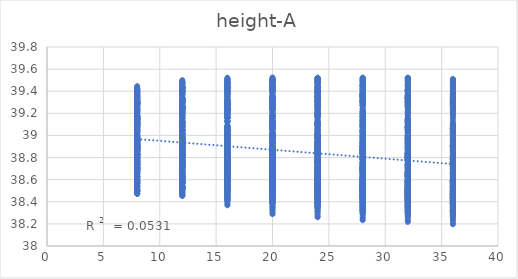
| Category | out:UTCI |
|---|---|
| 8.0 | 38.668 |
| 8.0 | 38.741 |
| 8.0 | 38.758 |
| 8.0 | 38.744 |
| 8.0 | 38.714 |
| 12.0 | 38.517 |
| 12.0 | 38.595 |
| 12.0 | 38.642 |
| 12.0 | 38.679 |
| 12.0 | 38.672 |
| 16.0 | 38.457 |
| 16.0 | 38.521 |
| 16.0 | 38.559 |
| 16.0 | 38.588 |
| 16.0 | 38.606 |
| 20.0 | 38.426 |
| 20.0 | 38.489 |
| 20.0 | 38.495 |
| 20.0 | 38.526 |
| 20.0 | 38.543 |
| 24.0 | 38.423 |
| 24.0 | 38.454 |
| 24.0 | 38.47 |
| 24.0 | 38.474 |
| 24.0 | 38.492 |
| 28.0 | 38.417 |
| 28.0 | 38.42 |
| 28.0 | 38.46 |
| 28.0 | 38.458 |
| 28.0 | 38.452 |
| 32.0 | 38.414 |
| 32.0 | 38.429 |
| 32.0 | 38.432 |
| 32.0 | 38.448 |
| 32.0 | 38.426 |
| 36.0 | 38.403 |
| 36.0 | 38.423 |
| 36.0 | 38.41 |
| 36.0 | 38.426 |
| 36.0 | 38.414 |
| 8.0 | 38.693 |
| 8.0 | 38.779 |
| 8.0 | 38.826 |
| 8.0 | 38.826 |
| 8.0 | 38.8 |
| 12.0 | 38.522 |
| 12.0 | 38.629 |
| 12.0 | 38.708 |
| 12.0 | 38.76 |
| 12.0 | 38.75 |
| 16.0 | 38.432 |
| 16.0 | 38.535 |
| 16.0 | 38.614 |
| 16.0 | 38.657 |
| 16.0 | 38.685 |
| 20.0 | 38.386 |
| 20.0 | 38.482 |
| 20.0 | 38.531 |
| 20.0 | 38.588 |
| 20.0 | 38.615 |
| 24.0 | 38.378 |
| 24.0 | 38.439 |
| 24.0 | 38.492 |
| 24.0 | 38.522 |
| 24.0 | 38.553 |
| 28.0 | 38.37 |
| 28.0 | 38.397 |
| 28.0 | 38.476 |
| 28.0 | 38.494 |
| 28.0 | 38.504 |
| 32.0 | 38.364 |
| 32.0 | 38.402 |
| 32.0 | 38.442 |
| 32.0 | 38.48 |
| 32.0 | 38.47 |
| 36.0 | 38.352 |
| 36.0 | 38.397 |
| 36.0 | 38.416 |
| 36.0 | 38.455 |
| 36.0 | 38.456 |
| 8.0 | 38.703 |
| 8.0 | 38.82 |
| 8.0 | 38.854 |
| 8.0 | 38.875 |
| 8.0 | 38.856 |
| 12.0 | 38.522 |
| 12.0 | 38.662 |
| 12.0 | 38.729 |
| 12.0 | 38.799 |
| 12.0 | 38.802 |
| 16.0 | 38.418 |
| 16.0 | 38.557 |
| 16.0 | 38.63 |
| 16.0 | 38.697 |
| 16.0 | 38.734 |
| 20.0 | 38.355 |
| 20.0 | 38.493 |
| 20.0 | 38.54 |
| 20.0 | 38.623 |
| 20.0 | 38.661 |
| 24.0 | 38.34 |
| 24.0 | 38.436 |
| 24.0 | 38.489 |
| 24.0 | 38.549 |
| 24.0 | 38.593 |
| 28.0 | 38.33 |
| 28.0 | 38.388 |
| 28.0 | 38.463 |
| 28.0 | 38.512 |
| 28.0 | 38.534 |
| 32.0 | 38.324 |
| 32.0 | 38.389 |
| 32.0 | 38.424 |
| 32.0 | 38.49 |
| 32.0 | 38.494 |
| 36.0 | 38.31 |
| 36.0 | 38.383 |
| 36.0 | 38.394 |
| 36.0 | 38.462 |
| 36.0 | 38.472 |
| 8.0 | 38.712 |
| 8.0 | 38.824 |
| 8.0 | 38.878 |
| 8.0 | 38.886 |
| 8.0 | 38.88 |
| 12.0 | 38.524 |
| 12.0 | 38.658 |
| 12.0 | 38.749 |
| 12.0 | 38.808 |
| 12.0 | 38.826 |
| 16.0 | 38.414 |
| 16.0 | 38.547 |
| 16.0 | 38.644 |
| 16.0 | 38.704 |
| 16.0 | 38.756 |
| 20.0 | 38.343 |
| 20.0 | 38.474 |
| 20.0 | 38.547 |
| 20.0 | 38.622 |
| 20.0 | 38.68 |
| 24.0 | 38.319 |
| 24.0 | 38.407 |
| 24.0 | 38.491 |
| 24.0 | 38.544 |
| 24.0 | 38.609 |
| 28.0 | 38.305 |
| 28.0 | 38.348 |
| 28.0 | 38.458 |
| 28.0 | 38.501 |
| 28.0 | 38.547 |
| 32.0 | 38.297 |
| 32.0 | 38.344 |
| 32.0 | 38.413 |
| 32.0 | 38.473 |
| 32.0 | 38.499 |
| 36.0 | 38.282 |
| 36.0 | 38.334 |
| 36.0 | 38.38 |
| 36.0 | 38.439 |
| 36.0 | 38.473 |
| 8.0 | 38.71 |
| 8.0 | 38.832 |
| 8.0 | 38.879 |
| 8.0 | 38.908 |
| 8.0 | 38.891 |
| 12.0 | 38.52 |
| 12.0 | 38.661 |
| 12.0 | 38.745 |
| 12.0 | 38.826 |
| 12.0 | 38.833 |
| 16.0 | 38.406 |
| 16.0 | 38.545 |
| 16.0 | 38.636 |
| 16.0 | 38.719 |
| 16.0 | 38.76 |
| 20.0 | 38.332 |
| 20.0 | 38.468 |
| 20.0 | 38.534 |
| 20.0 | 38.634 |
| 20.0 | 38.681 |
| 24.0 | 38.305 |
| 24.0 | 38.398 |
| 24.0 | 38.477 |
| 24.0 | 38.554 |
| 24.0 | 38.609 |
| 28.0 | 38.285 |
| 28.0 | 38.335 |
| 28.0 | 38.439 |
| 28.0 | 38.509 |
| 28.0 | 38.543 |
| 32.0 | 38.275 |
| 32.0 | 38.327 |
| 32.0 | 38.388 |
| 32.0 | 38.475 |
| 32.0 | 38.493 |
| 36.0 | 38.26 |
| 36.0 | 38.313 |
| 36.0 | 38.346 |
| 36.0 | 38.434 |
| 36.0 | 38.462 |
| 8.0 | 38.703 |
| 8.0 | 38.833 |
| 8.0 | 38.884 |
| 8.0 | 38.91 |
| 8.0 | 38.909 |
| 12.0 | 38.51 |
| 12.0 | 38.661 |
| 12.0 | 38.746 |
| 12.0 | 38.824 |
| 12.0 | 38.847 |
| 16.0 | 38.396 |
| 16.0 | 38.542 |
| 16.0 | 38.633 |
| 16.0 | 38.716 |
| 16.0 | 38.771 |
| 20.0 | 38.319 |
| 20.0 | 38.461 |
| 20.0 | 38.527 |
| 20.0 | 38.627 |
| 20.0 | 38.69 |
| 24.0 | 38.291 |
| 24.0 | 38.389 |
| 24.0 | 38.467 |
| 24.0 | 38.544 |
| 24.0 | 38.616 |
| 28.0 | 38.265 |
| 28.0 | 38.321 |
| 28.0 | 38.423 |
| 28.0 | 38.494 |
| 28.0 | 38.545 |
| 32.0 | 38.252 |
| 32.0 | 38.309 |
| 32.0 | 38.368 |
| 32.0 | 38.459 |
| 32.0 | 38.493 |
| 36.0 | 38.235 |
| 36.0 | 38.291 |
| 36.0 | 38.321 |
| 36.0 | 38.415 |
| 36.0 | 38.457 |
| 8.0 | 38.688 |
| 8.0 | 38.836 |
| 8.0 | 38.885 |
| 8.0 | 38.915 |
| 8.0 | 38.902 |
| 12.0 | 38.494 |
| 12.0 | 38.663 |
| 12.0 | 38.747 |
| 12.0 | 38.825 |
| 12.0 | 38.839 |
| 16.0 | 38.379 |
| 16.0 | 38.543 |
| 16.0 | 38.631 |
| 16.0 | 38.714 |
| 16.0 | 38.76 |
| 20.0 | 38.301 |
| 20.0 | 38.46 |
| 20.0 | 38.522 |
| 20.0 | 38.623 |
| 20.0 | 38.676 |
| 24.0 | 38.273 |
| 24.0 | 38.386 |
| 24.0 | 38.461 |
| 24.0 | 38.537 |
| 24.0 | 38.601 |
| 28.0 | 38.247 |
| 28.0 | 38.316 |
| 28.0 | 38.415 |
| 28.0 | 38.485 |
| 28.0 | 38.528 |
| 32.0 | 38.232 |
| 32.0 | 38.303 |
| 32.0 | 38.358 |
| 32.0 | 38.448 |
| 32.0 | 38.475 |
| 36.0 | 38.212 |
| 36.0 | 38.282 |
| 36.0 | 38.309 |
| 36.0 | 38.402 |
| 36.0 | 38.438 |
| 8.0 | 38.678 |
| 8.0 | 38.832 |
| 8.0 | 38.888 |
| 8.0 | 38.904 |
| 8.0 | 38.906 |
| 12.0 | 38.483 |
| 12.0 | 38.657 |
| 12.0 | 38.748 |
| 12.0 | 38.812 |
| 12.0 | 38.839 |
| 16.0 | 38.368 |
| 16.0 | 38.535 |
| 16.0 | 38.632 |
| 16.0 | 38.699 |
| 16.0 | 38.759 |
| 20.0 | 38.288 |
| 20.0 | 38.452 |
| 20.0 | 38.521 |
| 20.0 | 38.606 |
| 20.0 | 38.672 |
| 24.0 | 38.26 |
| 24.0 | 38.375 |
| 24.0 | 38.456 |
| 24.0 | 38.518 |
| 24.0 | 38.596 |
| 28.0 | 38.234 |
| 28.0 | 38.302 |
| 28.0 | 38.407 |
| 28.0 | 38.46 |
| 28.0 | 38.518 |
| 32.0 | 38.218 |
| 32.0 | 38.288 |
| 32.0 | 38.349 |
| 32.0 | 38.422 |
| 32.0 | 38.464 |
| 36.0 | 38.197 |
| 36.0 | 38.267 |
| 36.0 | 38.3 |
| 36.0 | 38.375 |
| 36.0 | 38.426 |
| 8.0 | 38.717 |
| 8.0 | 38.761 |
| 8.0 | 38.802 |
| 8.0 | 38.76 |
| 8.0 | 38.723 |
| 12.0 | 38.567 |
| 12.0 | 38.643 |
| 12.0 | 38.711 |
| 12.0 | 38.699 |
| 12.0 | 38.701 |
| 16.0 | 38.508 |
| 16.0 | 38.539 |
| 16.0 | 38.602 |
| 16.0 | 38.629 |
| 16.0 | 38.636 |
| 20.0 | 38.472 |
| 20.0 | 38.507 |
| 20.0 | 38.535 |
| 20.0 | 38.542 |
| 20.0 | 38.569 |
| 24.0 | 38.459 |
| 24.0 | 38.454 |
| 24.0 | 38.507 |
| 24.0 | 38.491 |
| 24.0 | 38.509 |
| 28.0 | 38.466 |
| 28.0 | 38.451 |
| 28.0 | 38.5 |
| 28.0 | 38.473 |
| 28.0 | 38.465 |
| 32.0 | 38.441 |
| 32.0 | 38.454 |
| 32.0 | 38.455 |
| 32.0 | 38.449 |
| 32.0 | 38.442 |
| 36.0 | 38.436 |
| 36.0 | 38.425 |
| 36.0 | 38.438 |
| 36.0 | 38.433 |
| 36.0 | 38.428 |
| 8.0 | 38.762 |
| 8.0 | 38.84 |
| 8.0 | 38.893 |
| 8.0 | 38.85 |
| 8.0 | 38.832 |
| 12.0 | 38.593 |
| 12.0 | 38.72 |
| 12.0 | 38.795 |
| 12.0 | 38.794 |
| 12.0 | 38.81 |
| 16.0 | 38.508 |
| 16.0 | 38.601 |
| 16.0 | 38.677 |
| 16.0 | 38.714 |
| 16.0 | 38.737 |
| 20.0 | 38.453 |
| 20.0 | 38.546 |
| 20.0 | 38.594 |
| 20.0 | 38.622 |
| 20.0 | 38.669 |
| 24.0 | 38.435 |
| 24.0 | 38.482 |
| 24.0 | 38.551 |
| 24.0 | 38.557 |
| 24.0 | 38.6 |
| 28.0 | 38.441 |
| 28.0 | 38.47 |
| 28.0 | 38.537 |
| 28.0 | 38.527 |
| 28.0 | 38.546 |
| 32.0 | 38.41 |
| 32.0 | 38.471 |
| 32.0 | 38.486 |
| 32.0 | 38.498 |
| 32.0 | 38.513 |
| 36.0 | 38.402 |
| 36.0 | 38.442 |
| 36.0 | 38.466 |
| 36.0 | 38.478 |
| 36.0 | 38.496 |
| 8.0 | 38.778 |
| 8.0 | 38.869 |
| 8.0 | 38.908 |
| 8.0 | 38.92 |
| 8.0 | 38.88 |
| 12.0 | 38.597 |
| 12.0 | 38.741 |
| 12.0 | 38.808 |
| 12.0 | 38.862 |
| 12.0 | 38.849 |
| 16.0 | 38.496 |
| 16.0 | 38.61 |
| 16.0 | 38.69 |
| 16.0 | 38.768 |
| 16.0 | 38.776 |
| 20.0 | 38.426 |
| 20.0 | 38.546 |
| 20.0 | 38.6 |
| 20.0 | 38.673 |
| 20.0 | 38.704 |
| 24.0 | 38.398 |
| 24.0 | 38.47 |
| 24.0 | 38.546 |
| 24.0 | 38.602 |
| 24.0 | 38.631 |
| 28.0 | 38.4 |
| 28.0 | 38.452 |
| 28.0 | 38.522 |
| 28.0 | 38.562 |
| 28.0 | 38.57 |
| 32.0 | 38.372 |
| 32.0 | 38.448 |
| 32.0 | 38.465 |
| 32.0 | 38.525 |
| 32.0 | 38.531 |
| 36.0 | 38.362 |
| 36.0 | 38.418 |
| 36.0 | 38.441 |
| 36.0 | 38.503 |
| 36.0 | 38.508 |
| 8.0 | 38.774 |
| 8.0 | 38.881 |
| 8.0 | 38.947 |
| 8.0 | 38.917 |
| 8.0 | 38.921 |
| 12.0 | 38.585 |
| 12.0 | 38.745 |
| 12.0 | 38.841 |
| 12.0 | 38.854 |
| 12.0 | 38.891 |
| 16.0 | 38.477 |
| 16.0 | 38.608 |
| 16.0 | 38.717 |
| 16.0 | 38.763 |
| 16.0 | 38.815 |
| 20.0 | 38.412 |
| 20.0 | 38.543 |
| 20.0 | 38.62 |
| 20.0 | 38.667 |
| 20.0 | 38.741 |
| 24.0 | 38.375 |
| 24.0 | 38.46 |
| 24.0 | 38.563 |
| 24.0 | 38.592 |
| 24.0 | 38.666 |
| 28.0 | 38.373 |
| 28.0 | 38.433 |
| 28.0 | 38.532 |
| 28.0 | 38.548 |
| 28.0 | 38.602 |
| 32.0 | 38.348 |
| 32.0 | 38.425 |
| 32.0 | 38.469 |
| 32.0 | 38.504 |
| 32.0 | 38.556 |
| 36.0 | 38.335 |
| 36.0 | 38.391 |
| 36.0 | 38.44 |
| 36.0 | 38.478 |
| 36.0 | 38.529 |
| 8.0 | 38.764 |
| 8.0 | 38.86 |
| 8.0 | 38.954 |
| 8.0 | 38.945 |
| 8.0 | 38.925 |
| 12.0 | 38.572 |
| 12.0 | 38.722 |
| 12.0 | 38.844 |
| 12.0 | 38.878 |
| 12.0 | 38.892 |
| 16.0 | 38.461 |
| 16.0 | 38.579 |
| 16.0 | 38.716 |
| 16.0 | 38.783 |
| 16.0 | 38.812 |
| 20.0 | 38.393 |
| 20.0 | 38.509 |
| 20.0 | 38.615 |
| 20.0 | 38.684 |
| 20.0 | 38.737 |
| 24.0 | 38.358 |
| 24.0 | 38.433 |
| 24.0 | 38.555 |
| 24.0 | 38.607 |
| 24.0 | 38.661 |
| 28.0 | 38.349 |
| 28.0 | 38.4 |
| 28.0 | 38.519 |
| 28.0 | 38.561 |
| 28.0 | 38.595 |
| 32.0 | 38.324 |
| 32.0 | 38.389 |
| 32.0 | 38.453 |
| 32.0 | 38.514 |
| 32.0 | 38.546 |
| 36.0 | 38.31 |
| 36.0 | 38.352 |
| 36.0 | 38.416 |
| 36.0 | 38.48 |
| 36.0 | 38.515 |
| 8.0 | 38.776 |
| 8.0 | 38.889 |
| 8.0 | 38.964 |
| 8.0 | 38.959 |
| 8.0 | 38.943 |
| 12.0 | 38.584 |
| 12.0 | 38.746 |
| 12.0 | 38.852 |
| 12.0 | 38.889 |
| 12.0 | 38.906 |
| 16.0 | 38.47 |
| 16.0 | 38.601 |
| 16.0 | 38.719 |
| 16.0 | 38.792 |
| 16.0 | 38.823 |
| 20.0 | 38.4 |
| 20.0 | 38.526 |
| 20.0 | 38.614 |
| 20.0 | 38.69 |
| 20.0 | 38.746 |
| 24.0 | 38.362 |
| 24.0 | 38.445 |
| 24.0 | 38.552 |
| 24.0 | 38.61 |
| 24.0 | 38.668 |
| 28.0 | 38.339 |
| 28.0 | 38.392 |
| 28.0 | 38.506 |
| 28.0 | 38.559 |
| 28.0 | 38.593 |
| 32.0 | 38.31 |
| 32.0 | 38.378 |
| 32.0 | 38.435 |
| 32.0 | 38.51 |
| 32.0 | 38.543 |
| 36.0 | 38.294 |
| 36.0 | 38.339 |
| 36.0 | 38.394 |
| 36.0 | 38.473 |
| 36.0 | 38.507 |
| 8.0 | 38.763 |
| 8.0 | 38.894 |
| 8.0 | 38.944 |
| 8.0 | 38.952 |
| 8.0 | 38.955 |
| 12.0 | 38.566 |
| 12.0 | 38.75 |
| 12.0 | 38.829 |
| 12.0 | 38.879 |
| 12.0 | 38.918 |
| 16.0 | 38.451 |
| 16.0 | 38.603 |
| 16.0 | 38.695 |
| 16.0 | 38.778 |
| 16.0 | 38.832 |
| 20.0 | 38.379 |
| 20.0 | 38.526 |
| 20.0 | 38.588 |
| 20.0 | 38.674 |
| 20.0 | 38.752 |
| 24.0 | 38.339 |
| 24.0 | 38.442 |
| 24.0 | 38.525 |
| 24.0 | 38.591 |
| 24.0 | 38.672 |
| 28.0 | 38.314 |
| 28.0 | 38.388 |
| 28.0 | 38.476 |
| 28.0 | 38.538 |
| 28.0 | 38.596 |
| 32.0 | 38.292 |
| 32.0 | 38.373 |
| 32.0 | 38.415 |
| 32.0 | 38.491 |
| 32.0 | 38.548 |
| 36.0 | 38.274 |
| 36.0 | 38.334 |
| 36.0 | 38.371 |
| 36.0 | 38.454 |
| 36.0 | 38.51 |
| 8.0 | 38.741 |
| 8.0 | 38.87 |
| 8.0 | 38.954 |
| 8.0 | 38.95 |
| 8.0 | 38.959 |
| 12.0 | 38.541 |
| 12.0 | 38.726 |
| 12.0 | 38.839 |
| 12.0 | 38.874 |
| 12.0 | 38.92 |
| 16.0 | 38.429 |
| 16.0 | 38.579 |
| 16.0 | 38.703 |
| 16.0 | 38.773 |
| 16.0 | 38.834 |
| 20.0 | 38.358 |
| 20.0 | 38.501 |
| 20.0 | 38.595 |
| 20.0 | 38.667 |
| 20.0 | 38.751 |
| 24.0 | 38.318 |
| 24.0 | 38.415 |
| 24.0 | 38.528 |
| 24.0 | 38.583 |
| 24.0 | 38.669 |
| 28.0 | 38.293 |
| 28.0 | 38.359 |
| 28.0 | 38.477 |
| 28.0 | 38.525 |
| 28.0 | 38.588 |
| 32.0 | 38.269 |
| 32.0 | 38.344 |
| 32.0 | 38.413 |
| 32.0 | 38.476 |
| 32.0 | 38.539 |
| 36.0 | 38.259 |
| 36.0 | 38.316 |
| 36.0 | 38.368 |
| 36.0 | 38.435 |
| 36.0 | 38.496 |
| 8.0 | 38.79 |
| 8.0 | 38.817 |
| 8.0 | 38.802 |
| 8.0 | 38.809 |
| 8.0 | 38.819 |
| 12.0 | 38.619 |
| 12.0 | 38.723 |
| 12.0 | 38.74 |
| 12.0 | 38.769 |
| 12.0 | 38.764 |
| 16.0 | 38.538 |
| 16.0 | 38.586 |
| 16.0 | 38.651 |
| 16.0 | 38.706 |
| 16.0 | 38.716 |
| 20.0 | 38.503 |
| 20.0 | 38.541 |
| 20.0 | 38.563 |
| 20.0 | 38.624 |
| 20.0 | 38.652 |
| 24.0 | 38.477 |
| 24.0 | 38.501 |
| 24.0 | 38.516 |
| 24.0 | 38.562 |
| 24.0 | 38.586 |
| 28.0 | 38.472 |
| 28.0 | 38.47 |
| 28.0 | 38.49 |
| 28.0 | 38.512 |
| 28.0 | 38.535 |
| 32.0 | 38.455 |
| 32.0 | 38.465 |
| 32.0 | 38.457 |
| 32.0 | 38.503 |
| 32.0 | 38.493 |
| 36.0 | 38.445 |
| 36.0 | 38.453 |
| 36.0 | 38.441 |
| 36.0 | 38.476 |
| 36.0 | 38.472 |
| 8.0 | 38.822 |
| 8.0 | 38.918 |
| 8.0 | 38.896 |
| 8.0 | 38.908 |
| 8.0 | 38.923 |
| 12.0 | 38.633 |
| 12.0 | 38.801 |
| 12.0 | 38.832 |
| 12.0 | 38.855 |
| 12.0 | 38.874 |
| 16.0 | 38.533 |
| 16.0 | 38.666 |
| 16.0 | 38.731 |
| 16.0 | 38.786 |
| 16.0 | 38.823 |
| 20.0 | 38.48 |
| 20.0 | 38.605 |
| 20.0 | 38.638 |
| 20.0 | 38.704 |
| 20.0 | 38.756 |
| 24.0 | 38.446 |
| 24.0 | 38.551 |
| 24.0 | 38.578 |
| 24.0 | 38.632 |
| 24.0 | 38.681 |
| 28.0 | 38.44 |
| 28.0 | 38.514 |
| 28.0 | 38.543 |
| 28.0 | 38.574 |
| 28.0 | 38.625 |
| 32.0 | 38.42 |
| 32.0 | 38.507 |
| 32.0 | 38.507 |
| 32.0 | 38.557 |
| 32.0 | 38.577 |
| 36.0 | 38.411 |
| 36.0 | 38.493 |
| 36.0 | 38.486 |
| 36.0 | 38.527 |
| 36.0 | 38.549 |
| 8.0 | 38.832 |
| 8.0 | 38.925 |
| 8.0 | 38.944 |
| 8.0 | 38.969 |
| 8.0 | 38.98 |
| 12.0 | 38.632 |
| 12.0 | 38.813 |
| 12.0 | 38.868 |
| 12.0 | 38.91 |
| 12.0 | 38.928 |
| 16.0 | 38.52 |
| 16.0 | 38.667 |
| 16.0 | 38.765 |
| 16.0 | 38.841 |
| 16.0 | 38.865 |
| 20.0 | 38.457 |
| 20.0 | 38.599 |
| 20.0 | 38.667 |
| 20.0 | 38.756 |
| 20.0 | 38.796 |
| 24.0 | 38.418 |
| 24.0 | 38.535 |
| 24.0 | 38.6 |
| 24.0 | 38.68 |
| 24.0 | 38.722 |
| 28.0 | 38.405 |
| 28.0 | 38.488 |
| 28.0 | 38.555 |
| 28.0 | 38.614 |
| 28.0 | 38.662 |
| 32.0 | 38.384 |
| 32.0 | 38.477 |
| 32.0 | 38.514 |
| 32.0 | 38.591 |
| 32.0 | 38.607 |
| 36.0 | 38.374 |
| 36.0 | 38.461 |
| 36.0 | 38.489 |
| 36.0 | 38.555 |
| 36.0 | 38.574 |
| 8.0 | 38.833 |
| 8.0 | 38.943 |
| 8.0 | 38.957 |
| 8.0 | 38.99 |
| 8.0 | 39.021 |
| 12.0 | 38.626 |
| 12.0 | 38.826 |
| 12.0 | 38.88 |
| 12.0 | 38.932 |
| 12.0 | 38.966 |
| 16.0 | 38.509 |
| 16.0 | 38.674 |
| 16.0 | 38.772 |
| 16.0 | 38.86 |
| 16.0 | 38.9 |
| 20.0 | 38.443 |
| 20.0 | 38.593 |
| 20.0 | 38.666 |
| 20.0 | 38.77 |
| 20.0 | 38.829 |
| 24.0 | 38.399 |
| 24.0 | 38.525 |
| 24.0 | 38.596 |
| 24.0 | 38.692 |
| 24.0 | 38.753 |
| 28.0 | 38.381 |
| 28.0 | 38.471 |
| 28.0 | 38.546 |
| 28.0 | 38.623 |
| 28.0 | 38.691 |
| 32.0 | 38.359 |
| 32.0 | 38.455 |
| 32.0 | 38.5 |
| 32.0 | 38.595 |
| 32.0 | 38.634 |
| 36.0 | 38.347 |
| 36.0 | 38.435 |
| 36.0 | 38.466 |
| 36.0 | 38.552 |
| 36.0 | 38.596 |
| 8.0 | 38.83 |
| 8.0 | 38.943 |
| 8.0 | 38.97 |
| 8.0 | 39 |
| 8.0 | 39.032 |
| 12.0 | 38.622 |
| 12.0 | 38.822 |
| 12.0 | 38.889 |
| 12.0 | 38.938 |
| 12.0 | 38.971 |
| 16.0 | 38.5 |
| 16.0 | 38.666 |
| 16.0 | 38.777 |
| 16.0 | 38.864 |
| 16.0 | 38.907 |
| 20.0 | 38.43 |
| 20.0 | 38.581 |
| 20.0 | 38.668 |
| 20.0 | 38.771 |
| 20.0 | 38.834 |
| 24.0 | 38.386 |
| 24.0 | 38.507 |
| 24.0 | 38.596 |
| 24.0 | 38.69 |
| 24.0 | 38.761 |
| 28.0 | 38.364 |
| 28.0 | 38.45 |
| 28.0 | 38.544 |
| 28.0 | 38.619 |
| 28.0 | 38.696 |
| 32.0 | 38.343 |
| 32.0 | 38.43 |
| 32.0 | 38.496 |
| 32.0 | 38.588 |
| 32.0 | 38.637 |
| 36.0 | 38.329 |
| 36.0 | 38.406 |
| 36.0 | 38.457 |
| 36.0 | 38.541 |
| 36.0 | 38.595 |
| 8.0 | 38.839 |
| 8.0 | 38.94 |
| 8.0 | 38.98 |
| 8.0 | 39.012 |
| 8.0 | 39.033 |
| 12.0 | 38.628 |
| 12.0 | 38.815 |
| 12.0 | 38.899 |
| 12.0 | 38.947 |
| 12.0 | 38.974 |
| 16.0 | 38.505 |
| 16.0 | 38.654 |
| 16.0 | 38.782 |
| 16.0 | 38.869 |
| 16.0 | 38.907 |
| 20.0 | 38.435 |
| 20.0 | 38.566 |
| 20.0 | 38.668 |
| 20.0 | 38.774 |
| 20.0 | 38.832 |
| 24.0 | 38.389 |
| 24.0 | 38.49 |
| 24.0 | 38.594 |
| 24.0 | 38.691 |
| 24.0 | 38.757 |
| 28.0 | 38.361 |
| 28.0 | 38.434 |
| 28.0 | 38.543 |
| 28.0 | 38.615 |
| 28.0 | 38.687 |
| 32.0 | 38.336 |
| 32.0 | 38.413 |
| 32.0 | 38.494 |
| 32.0 | 38.582 |
| 32.0 | 38.626 |
| 36.0 | 38.322 |
| 36.0 | 38.386 |
| 36.0 | 38.452 |
| 36.0 | 38.533 |
| 36.0 | 38.583 |
| 8.0 | 38.833 |
| 8.0 | 38.948 |
| 8.0 | 38.979 |
| 8.0 | 39.032 |
| 8.0 | 39.057 |
| 12.0 | 38.621 |
| 12.0 | 38.822 |
| 12.0 | 38.895 |
| 12.0 | 38.966 |
| 12.0 | 38.994 |
| 16.0 | 38.496 |
| 16.0 | 38.66 |
| 16.0 | 38.777 |
| 16.0 | 38.884 |
| 16.0 | 38.926 |
| 20.0 | 38.425 |
| 20.0 | 38.57 |
| 20.0 | 38.662 |
| 20.0 | 38.787 |
| 20.0 | 38.849 |
| 24.0 | 38.379 |
| 24.0 | 38.492 |
| 24.0 | 38.586 |
| 24.0 | 38.701 |
| 24.0 | 38.771 |
| 28.0 | 38.351 |
| 28.0 | 38.434 |
| 28.0 | 38.532 |
| 28.0 | 38.623 |
| 28.0 | 38.7 |
| 32.0 | 38.326 |
| 32.0 | 38.412 |
| 32.0 | 38.482 |
| 32.0 | 38.589 |
| 32.0 | 38.635 |
| 36.0 | 38.311 |
| 36.0 | 38.384 |
| 36.0 | 38.439 |
| 36.0 | 38.54 |
| 36.0 | 38.59 |
| 8.0 | 38.837 |
| 8.0 | 38.948 |
| 8.0 | 38.981 |
| 8.0 | 39.031 |
| 8.0 | 39.053 |
| 12.0 | 38.628 |
| 12.0 | 38.822 |
| 12.0 | 38.897 |
| 12.0 | 38.963 |
| 12.0 | 38.99 |
| 16.0 | 38.499 |
| 16.0 | 38.659 |
| 16.0 | 38.776 |
| 16.0 | 38.88 |
| 16.0 | 38.92 |
| 20.0 | 38.426 |
| 20.0 | 38.566 |
| 20.0 | 38.658 |
| 20.0 | 38.781 |
| 20.0 | 38.843 |
| 24.0 | 38.38 |
| 24.0 | 38.486 |
| 24.0 | 38.578 |
| 24.0 | 38.69 |
| 24.0 | 38.76 |
| 28.0 | 38.351 |
| 28.0 | 38.427 |
| 28.0 | 38.523 |
| 28.0 | 38.61 |
| 28.0 | 38.688 |
| 32.0 | 38.325 |
| 32.0 | 38.404 |
| 32.0 | 38.471 |
| 32.0 | 38.576 |
| 32.0 | 38.622 |
| 36.0 | 38.305 |
| 36.0 | 38.369 |
| 36.0 | 38.417 |
| 36.0 | 38.526 |
| 36.0 | 38.58 |
| 8.0 | 38.891 |
| 8.0 | 38.894 |
| 8.0 | 38.962 |
| 8.0 | 38.928 |
| 8.0 | 38.893 |
| 12.0 | 38.713 |
| 12.0 | 38.833 |
| 12.0 | 38.901 |
| 12.0 | 38.871 |
| 12.0 | 38.873 |
| 16.0 | 38.625 |
| 16.0 | 38.708 |
| 16.0 | 38.813 |
| 16.0 | 38.824 |
| 16.0 | 38.81 |
| 20.0 | 38.565 |
| 20.0 | 38.628 |
| 20.0 | 38.734 |
| 20.0 | 38.752 |
| 20.0 | 38.771 |
| 24.0 | 38.521 |
| 24.0 | 38.578 |
| 24.0 | 38.653 |
| 24.0 | 38.689 |
| 24.0 | 38.724 |
| 28.0 | 38.518 |
| 28.0 | 38.534 |
| 28.0 | 38.615 |
| 28.0 | 38.633 |
| 28.0 | 38.649 |
| 32.0 | 38.51 |
| 32.0 | 38.523 |
| 32.0 | 38.578 |
| 32.0 | 38.575 |
| 32.0 | 38.601 |
| 36.0 | 38.479 |
| 36.0 | 38.5 |
| 36.0 | 38.528 |
| 36.0 | 38.567 |
| 36.0 | 38.561 |
| 8.0 | 38.921 |
| 8.0 | 39.003 |
| 8.0 | 39.055 |
| 8.0 | 39.036 |
| 8.0 | 39.028 |
| 12.0 | 38.734 |
| 12.0 | 38.923 |
| 12.0 | 38.988 |
| 12.0 | 38.979 |
| 12.0 | 38.99 |
| 16.0 | 38.634 |
| 16.0 | 38.791 |
| 16.0 | 38.892 |
| 16.0 | 38.931 |
| 16.0 | 38.925 |
| 20.0 | 38.556 |
| 20.0 | 38.706 |
| 20.0 | 38.81 |
| 20.0 | 38.856 |
| 20.0 | 38.884 |
| 24.0 | 38.507 |
| 24.0 | 38.644 |
| 24.0 | 38.725 |
| 24.0 | 38.788 |
| 24.0 | 38.832 |
| 28.0 | 38.5 |
| 28.0 | 38.593 |
| 28.0 | 38.68 |
| 28.0 | 38.726 |
| 28.0 | 38.757 |
| 32.0 | 38.487 |
| 32.0 | 38.577 |
| 32.0 | 38.635 |
| 32.0 | 38.662 |
| 32.0 | 38.704 |
| 36.0 | 38.453 |
| 36.0 | 38.553 |
| 36.0 | 38.584 |
| 36.0 | 38.647 |
| 36.0 | 38.659 |
| 8.0 | 38.963 |
| 8.0 | 39.019 |
| 8.0 | 39.096 |
| 8.0 | 39.098 |
| 8.0 | 39.072 |
| 12.0 | 38.767 |
| 12.0 | 38.932 |
| 12.0 | 39.019 |
| 12.0 | 39.036 |
| 12.0 | 39.031 |
| 16.0 | 38.655 |
| 16.0 | 38.798 |
| 16.0 | 38.922 |
| 16.0 | 38.989 |
| 16.0 | 38.978 |
| 20.0 | 38.563 |
| 20.0 | 38.708 |
| 20.0 | 38.836 |
| 20.0 | 38.909 |
| 20.0 | 38.934 |
| 24.0 | 38.51 |
| 24.0 | 38.641 |
| 24.0 | 38.748 |
| 24.0 | 38.836 |
| 24.0 | 38.882 |
| 28.0 | 38.499 |
| 28.0 | 38.58 |
| 28.0 | 38.699 |
| 28.0 | 38.775 |
| 28.0 | 38.807 |
| 32.0 | 38.478 |
| 32.0 | 38.561 |
| 32.0 | 38.647 |
| 32.0 | 38.708 |
| 32.0 | 38.752 |
| 36.0 | 38.447 |
| 36.0 | 38.535 |
| 36.0 | 38.593 |
| 36.0 | 38.687 |
| 36.0 | 38.702 |
| 8.0 | 38.962 |
| 8.0 | 39.047 |
| 8.0 | 39.13 |
| 8.0 | 39.127 |
| 8.0 | 39.121 |
| 12.0 | 38.76 |
| 12.0 | 38.959 |
| 12.0 | 39.049 |
| 12.0 | 39.061 |
| 12.0 | 39.077 |
| 16.0 | 38.643 |
| 16.0 | 38.821 |
| 16.0 | 38.947 |
| 16.0 | 39.011 |
| 16.0 | 39.022 |
| 20.0 | 38.542 |
| 20.0 | 38.722 |
| 20.0 | 38.857 |
| 20.0 | 38.92 |
| 20.0 | 38.976 |
| 24.0 | 38.491 |
| 24.0 | 38.653 |
| 24.0 | 38.767 |
| 24.0 | 38.848 |
| 24.0 | 38.92 |
| 28.0 | 38.473 |
| 28.0 | 38.587 |
| 28.0 | 38.716 |
| 28.0 | 38.786 |
| 28.0 | 38.845 |
| 32.0 | 38.448 |
| 32.0 | 38.562 |
| 32.0 | 38.66 |
| 32.0 | 38.717 |
| 32.0 | 38.79 |
| 36.0 | 38.42 |
| 36.0 | 38.533 |
| 36.0 | 38.603 |
| 36.0 | 38.693 |
| 36.0 | 38.736 |
| 8.0 | 38.937 |
| 8.0 | 39.056 |
| 8.0 | 39.126 |
| 8.0 | 39.156 |
| 8.0 | 39.153 |
| 12.0 | 38.733 |
| 12.0 | 38.964 |
| 12.0 | 39.047 |
| 12.0 | 39.086 |
| 12.0 | 39.107 |
| 16.0 | 38.613 |
| 16.0 | 38.822 |
| 16.0 | 38.941 |
| 16.0 | 39.034 |
| 16.0 | 39.05 |
| 20.0 | 38.509 |
| 20.0 | 38.721 |
| 20.0 | 38.848 |
| 20.0 | 38.94 |
| 20.0 | 39.003 |
| 24.0 | 38.465 |
| 24.0 | 38.644 |
| 24.0 | 38.755 |
| 24.0 | 38.867 |
| 24.0 | 38.934 |
| 28.0 | 38.443 |
| 28.0 | 38.573 |
| 28.0 | 38.705 |
| 28.0 | 38.802 |
| 28.0 | 38.858 |
| 32.0 | 38.418 |
| 32.0 | 38.548 |
| 32.0 | 38.645 |
| 32.0 | 38.733 |
| 32.0 | 38.802 |
| 36.0 | 38.388 |
| 36.0 | 38.517 |
| 36.0 | 38.59 |
| 36.0 | 38.706 |
| 36.0 | 38.747 |
| 8.0 | 38.958 |
| 8.0 | 39.056 |
| 8.0 | 39.155 |
| 8.0 | 39.159 |
| 8.0 | 39.169 |
| 12.0 | 38.756 |
| 12.0 | 38.963 |
| 12.0 | 39.072 |
| 12.0 | 39.088 |
| 12.0 | 39.121 |
| 16.0 | 38.634 |
| 16.0 | 38.818 |
| 16.0 | 38.964 |
| 16.0 | 39.032 |
| 16.0 | 39.061 |
| 20.0 | 38.527 |
| 20.0 | 38.715 |
| 20.0 | 38.87 |
| 20.0 | 38.941 |
| 20.0 | 39.011 |
| 24.0 | 38.478 |
| 24.0 | 38.635 |
| 24.0 | 38.776 |
| 24.0 | 38.865 |
| 24.0 | 38.939 |
| 28.0 | 38.444 |
| 28.0 | 38.567 |
| 28.0 | 38.716 |
| 28.0 | 38.795 |
| 28.0 | 38.865 |
| 32.0 | 38.415 |
| 32.0 | 38.536 |
| 32.0 | 38.655 |
| 32.0 | 38.725 |
| 32.0 | 38.808 |
| 36.0 | 38.384 |
| 36.0 | 38.503 |
| 36.0 | 38.597 |
| 36.0 | 38.697 |
| 36.0 | 38.751 |
| 8.0 | 38.959 |
| 8.0 | 39.064 |
| 8.0 | 39.152 |
| 8.0 | 39.167 |
| 8.0 | 39.169 |
| 12.0 | 38.752 |
| 12.0 | 38.969 |
| 12.0 | 39.068 |
| 12.0 | 39.095 |
| 12.0 | 39.12 |
| 16.0 | 38.63 |
| 16.0 | 38.822 |
| 16.0 | 38.958 |
| 16.0 | 39.038 |
| 16.0 | 39.058 |
| 20.0 | 38.525 |
| 20.0 | 38.717 |
| 20.0 | 38.861 |
| 20.0 | 38.945 |
| 20.0 | 39.007 |
| 24.0 | 38.475 |
| 24.0 | 38.635 |
| 24.0 | 38.765 |
| 24.0 | 38.869 |
| 24.0 | 38.935 |
| 28.0 | 38.444 |
| 28.0 | 38.564 |
| 28.0 | 38.703 |
| 28.0 | 38.798 |
| 28.0 | 38.86 |
| 32.0 | 38.412 |
| 32.0 | 38.528 |
| 32.0 | 38.644 |
| 32.0 | 38.724 |
| 32.0 | 38.808 |
| 36.0 | 38.38 |
| 36.0 | 38.493 |
| 36.0 | 38.586 |
| 36.0 | 38.694 |
| 36.0 | 38.75 |
| 8.0 | 38.956 |
| 8.0 | 39.045 |
| 8.0 | 39.142 |
| 8.0 | 39.182 |
| 8.0 | 39.176 |
| 12.0 | 38.748 |
| 12.0 | 38.948 |
| 12.0 | 39.055 |
| 12.0 | 39.11 |
| 12.0 | 39.125 |
| 16.0 | 38.627 |
| 16.0 | 38.8 |
| 16.0 | 38.945 |
| 16.0 | 39.052 |
| 16.0 | 39.062 |
| 20.0 | 38.521 |
| 20.0 | 38.694 |
| 20.0 | 38.85 |
| 20.0 | 38.959 |
| 20.0 | 39.009 |
| 24.0 | 38.473 |
| 24.0 | 38.61 |
| 24.0 | 38.753 |
| 24.0 | 38.882 |
| 24.0 | 38.934 |
| 28.0 | 38.439 |
| 28.0 | 38.539 |
| 28.0 | 38.692 |
| 28.0 | 38.809 |
| 28.0 | 38.858 |
| 32.0 | 38.408 |
| 32.0 | 38.501 |
| 32.0 | 38.63 |
| 32.0 | 38.735 |
| 32.0 | 38.803 |
| 36.0 | 38.386 |
| 36.0 | 38.467 |
| 36.0 | 38.582 |
| 36.0 | 38.696 |
| 36.0 | 38.739 |
| 8.0 | 39.05 |
| 8.0 | 39.087 |
| 8.0 | 39.101 |
| 8.0 | 39.045 |
| 8.0 | 38.994 |
| 12.0 | 38.886 |
| 12.0 | 39.009 |
| 12.0 | 39.091 |
| 12.0 | 39.048 |
| 12.0 | 39.019 |
| 16.0 | 38.744 |
| 16.0 | 38.904 |
| 16.0 | 39.009 |
| 16.0 | 39.019 |
| 16.0 | 39.022 |
| 20.0 | 38.655 |
| 20.0 | 38.789 |
| 20.0 | 38.932 |
| 20.0 | 38.976 |
| 20.0 | 38.992 |
| 24.0 | 38.596 |
| 24.0 | 38.71 |
| 24.0 | 38.851 |
| 24.0 | 38.918 |
| 24.0 | 38.94 |
| 28.0 | 38.57 |
| 28.0 | 38.645 |
| 28.0 | 38.764 |
| 28.0 | 38.853 |
| 28.0 | 38.884 |
| 32.0 | 38.551 |
| 32.0 | 38.584 |
| 32.0 | 38.711 |
| 32.0 | 38.788 |
| 32.0 | 38.841 |
| 36.0 | 38.527 |
| 36.0 | 38.563 |
| 36.0 | 38.664 |
| 36.0 | 38.724 |
| 36.0 | 38.796 |
| 8.0 | 39.098 |
| 8.0 | 39.161 |
| 8.0 | 39.193 |
| 8.0 | 39.147 |
| 8.0 | 39.104 |
| 12.0 | 38.923 |
| 12.0 | 39.074 |
| 12.0 | 39.177 |
| 12.0 | 39.153 |
| 12.0 | 39.127 |
| 16.0 | 38.775 |
| 16.0 | 38.96 |
| 16.0 | 39.092 |
| 16.0 | 39.12 |
| 16.0 | 39.126 |
| 20.0 | 38.677 |
| 20.0 | 38.843 |
| 20.0 | 39.009 |
| 20.0 | 39.074 |
| 20.0 | 39.095 |
| 24.0 | 38.612 |
| 24.0 | 38.764 |
| 24.0 | 38.93 |
| 24.0 | 39.014 |
| 24.0 | 39.042 |
| 28.0 | 38.579 |
| 28.0 | 38.69 |
| 28.0 | 38.842 |
| 28.0 | 38.948 |
| 28.0 | 38.985 |
| 32.0 | 38.561 |
| 32.0 | 38.628 |
| 32.0 | 38.785 |
| 32.0 | 38.883 |
| 32.0 | 38.941 |
| 36.0 | 38.534 |
| 36.0 | 38.603 |
| 36.0 | 38.735 |
| 36.0 | 38.817 |
| 36.0 | 38.896 |
| 8.0 | 39.095 |
| 8.0 | 39.215 |
| 8.0 | 39.242 |
| 8.0 | 39.21 |
| 8.0 | 39.181 |
| 12.0 | 38.916 |
| 12.0 | 39.122 |
| 12.0 | 39.221 |
| 12.0 | 39.212 |
| 12.0 | 39.202 |
| 16.0 | 38.761 |
| 16.0 | 39.002 |
| 16.0 | 39.131 |
| 16.0 | 39.176 |
| 16.0 | 39.198 |
| 20.0 | 38.658 |
| 20.0 | 38.881 |
| 20.0 | 39.049 |
| 20.0 | 39.128 |
| 20.0 | 39.165 |
| 24.0 | 38.589 |
| 24.0 | 38.8 |
| 24.0 | 38.967 |
| 24.0 | 39.066 |
| 24.0 | 39.111 |
| 28.0 | 38.553 |
| 28.0 | 38.725 |
| 28.0 | 38.881 |
| 28.0 | 39 |
| 28.0 | 39.053 |
| 32.0 | 38.53 |
| 32.0 | 38.66 |
| 32.0 | 38.821 |
| 32.0 | 38.934 |
| 32.0 | 39.008 |
| 36.0 | 38.502 |
| 36.0 | 38.629 |
| 36.0 | 38.767 |
| 36.0 | 38.865 |
| 36.0 | 38.963 |
| 8.0 | 39.108 |
| 8.0 | 39.216 |
| 8.0 | 39.274 |
| 8.0 | 39.253 |
| 8.0 | 39.23 |
| 12.0 | 38.921 |
| 12.0 | 39.114 |
| 12.0 | 39.249 |
| 12.0 | 39.254 |
| 12.0 | 39.25 |
| 16.0 | 38.761 |
| 16.0 | 38.995 |
| 16.0 | 39.157 |
| 16.0 | 39.218 |
| 16.0 | 39.243 |
| 20.0 | 38.654 |
| 20.0 | 38.884 |
| 20.0 | 39.071 |
| 20.0 | 39.156 |
| 20.0 | 39.208 |
| 24.0 | 38.58 |
| 24.0 | 38.8 |
| 24.0 | 38.987 |
| 24.0 | 39.093 |
| 24.0 | 39.152 |
| 28.0 | 38.543 |
| 28.0 | 38.723 |
| 28.0 | 38.897 |
| 28.0 | 39.021 |
| 28.0 | 39.094 |
| 32.0 | 38.516 |
| 32.0 | 38.658 |
| 32.0 | 38.838 |
| 32.0 | 38.954 |
| 32.0 | 39.047 |
| 36.0 | 38.485 |
| 36.0 | 38.624 |
| 36.0 | 38.784 |
| 36.0 | 38.888 |
| 36.0 | 39.001 |
| 8.0 | 39.113 |
| 8.0 | 39.23 |
| 8.0 | 39.283 |
| 8.0 | 39.282 |
| 8.0 | 39.255 |
| 12.0 | 38.925 |
| 12.0 | 39.126 |
| 12.0 | 39.255 |
| 12.0 | 39.281 |
| 12.0 | 39.272 |
| 16.0 | 38.761 |
| 16.0 | 39.004 |
| 16.0 | 39.16 |
| 16.0 | 39.243 |
| 16.0 | 39.263 |
| 20.0 | 38.65 |
| 20.0 | 38.889 |
| 20.0 | 39.072 |
| 20.0 | 39.175 |
| 20.0 | 39.225 |
| 24.0 | 38.569 |
| 24.0 | 38.788 |
| 24.0 | 38.986 |
| 24.0 | 39.109 |
| 24.0 | 39.171 |
| 28.0 | 38.532 |
| 28.0 | 38.709 |
| 28.0 | 38.895 |
| 28.0 | 39.04 |
| 28.0 | 39.111 |
| 32.0 | 38.504 |
| 32.0 | 38.644 |
| 32.0 | 38.836 |
| 32.0 | 38.973 |
| 32.0 | 39.063 |
| 36.0 | 38.471 |
| 36.0 | 38.608 |
| 36.0 | 38.78 |
| 36.0 | 38.906 |
| 36.0 | 39.017 |
| 8.0 | 39.111 |
| 8.0 | 39.228 |
| 8.0 | 39.291 |
| 8.0 | 39.293 |
| 8.0 | 39.273 |
| 12.0 | 38.923 |
| 12.0 | 39.127 |
| 12.0 | 39.253 |
| 12.0 | 39.291 |
| 12.0 | 39.286 |
| 16.0 | 38.756 |
| 16.0 | 39 |
| 16.0 | 39.158 |
| 16.0 | 39.25 |
| 16.0 | 39.274 |
| 20.0 | 38.641 |
| 20.0 | 38.882 |
| 20.0 | 39.067 |
| 20.0 | 39.181 |
| 20.0 | 39.234 |
| 24.0 | 38.559 |
| 24.0 | 38.779 |
| 24.0 | 38.979 |
| 24.0 | 39.114 |
| 24.0 | 39.178 |
| 28.0 | 38.521 |
| 28.0 | 38.698 |
| 28.0 | 38.902 |
| 28.0 | 39.043 |
| 28.0 | 39.125 |
| 32.0 | 38.493 |
| 32.0 | 38.631 |
| 32.0 | 38.839 |
| 32.0 | 38.975 |
| 32.0 | 39.075 |
| 36.0 | 38.459 |
| 36.0 | 38.593 |
| 36.0 | 38.782 |
| 36.0 | 38.907 |
| 36.0 | 39.028 |
| 8.0 | 39.105 |
| 8.0 | 39.217 |
| 8.0 | 39.289 |
| 8.0 | 39.304 |
| 8.0 | 39.282 |
| 12.0 | 38.916 |
| 12.0 | 39.114 |
| 12.0 | 39.255 |
| 12.0 | 39.298 |
| 12.0 | 39.298 |
| 16.0 | 38.751 |
| 16.0 | 38.991 |
| 16.0 | 39.158 |
| 16.0 | 39.255 |
| 16.0 | 39.287 |
| 20.0 | 38.636 |
| 20.0 | 38.874 |
| 20.0 | 39.067 |
| 20.0 | 39.184 |
| 20.0 | 39.247 |
| 24.0 | 38.554 |
| 24.0 | 38.771 |
| 24.0 | 38.977 |
| 24.0 | 39.116 |
| 24.0 | 39.191 |
| 28.0 | 38.515 |
| 28.0 | 38.688 |
| 28.0 | 38.901 |
| 28.0 | 39.044 |
| 28.0 | 39.137 |
| 32.0 | 38.481 |
| 32.0 | 38.63 |
| 32.0 | 38.823 |
| 32.0 | 38.983 |
| 32.0 | 39.076 |
| 36.0 | 38.447 |
| 36.0 | 38.59 |
| 36.0 | 38.766 |
| 36.0 | 38.915 |
| 36.0 | 39.023 |
| 8.0 | 39.096 |
| 8.0 | 39.232 |
| 8.0 | 39.289 |
| 8.0 | 39.302 |
| 8.0 | 39.295 |
| 12.0 | 38.904 |
| 12.0 | 39.129 |
| 12.0 | 39.255 |
| 12.0 | 39.294 |
| 12.0 | 39.31 |
| 16.0 | 38.736 |
| 16.0 | 39.004 |
| 16.0 | 39.156 |
| 16.0 | 39.25 |
| 16.0 | 39.297 |
| 20.0 | 38.62 |
| 20.0 | 38.884 |
| 20.0 | 39.065 |
| 20.0 | 39.178 |
| 20.0 | 39.256 |
| 24.0 | 38.536 |
| 24.0 | 38.78 |
| 24.0 | 38.973 |
| 24.0 | 39.107 |
| 24.0 | 39.197 |
| 28.0 | 38.496 |
| 28.0 | 38.695 |
| 28.0 | 38.897 |
| 28.0 | 39.034 |
| 28.0 | 39.143 |
| 32.0 | 38.461 |
| 32.0 | 38.635 |
| 32.0 | 38.817 |
| 32.0 | 38.971 |
| 32.0 | 39.077 |
| 36.0 | 38.427 |
| 36.0 | 38.582 |
| 36.0 | 38.759 |
| 36.0 | 38.903 |
| 36.0 | 39.023 |
| 8.0 | 39.307 |
| 8.0 | 39.181 |
| 8.0 | 39.176 |
| 8.0 | 39.073 |
| 8.0 | 38.992 |
| 12.0 | 39.27 |
| 12.0 | 39.233 |
| 12.0 | 39.244 |
| 12.0 | 39.151 |
| 12.0 | 39.098 |
| 16.0 | 39.197 |
| 16.0 | 39.211 |
| 16.0 | 39.248 |
| 16.0 | 39.198 |
| 16.0 | 39.132 |
| 20.0 | 39.109 |
| 20.0 | 39.183 |
| 20.0 | 39.242 |
| 20.0 | 39.195 |
| 20.0 | 39.162 |
| 24.0 | 38.981 |
| 24.0 | 39.108 |
| 24.0 | 39.204 |
| 24.0 | 39.191 |
| 24.0 | 39.167 |
| 28.0 | 38.887 |
| 28.0 | 39.048 |
| 28.0 | 39.178 |
| 28.0 | 39.166 |
| 28.0 | 39.151 |
| 32.0 | 38.801 |
| 32.0 | 38.992 |
| 32.0 | 39.117 |
| 32.0 | 39.127 |
| 32.0 | 39.131 |
| 36.0 | 38.742 |
| 36.0 | 38.911 |
| 36.0 | 39.089 |
| 36.0 | 39.093 |
| 36.0 | 39.113 |
| 8.0 | 39.362 |
| 8.0 | 39.321 |
| 8.0 | 39.287 |
| 8.0 | 39.23 |
| 8.0 | 39.175 |
| 12.0 | 39.314 |
| 12.0 | 39.37 |
| 12.0 | 39.349 |
| 12.0 | 39.31 |
| 12.0 | 39.271 |
| 16.0 | 39.236 |
| 16.0 | 39.342 |
| 16.0 | 39.35 |
| 16.0 | 39.351 |
| 16.0 | 39.301 |
| 20.0 | 39.143 |
| 20.0 | 39.309 |
| 20.0 | 39.342 |
| 20.0 | 39.346 |
| 20.0 | 39.33 |
| 24.0 | 39.014 |
| 24.0 | 39.237 |
| 24.0 | 39.304 |
| 24.0 | 39.343 |
| 24.0 | 39.335 |
| 28.0 | 38.929 |
| 28.0 | 39.171 |
| 28.0 | 39.277 |
| 28.0 | 39.317 |
| 28.0 | 39.317 |
| 32.0 | 38.83 |
| 32.0 | 39.117 |
| 32.0 | 39.213 |
| 32.0 | 39.276 |
| 32.0 | 39.297 |
| 36.0 | 38.765 |
| 36.0 | 39.038 |
| 36.0 | 39.188 |
| 36.0 | 39.242 |
| 36.0 | 39.279 |
| 8.0 | 39.381 |
| 8.0 | 39.36 |
| 8.0 | 39.344 |
| 8.0 | 39.318 |
| 8.0 | 39.24 |
| 12.0 | 39.328 |
| 12.0 | 39.409 |
| 12.0 | 39.403 |
| 12.0 | 39.393 |
| 12.0 | 39.333 |
| 16.0 | 39.239 |
| 16.0 | 39.374 |
| 16.0 | 39.399 |
| 16.0 | 39.429 |
| 16.0 | 39.37 |
| 20.0 | 39.134 |
| 20.0 | 39.335 |
| 20.0 | 39.388 |
| 20.0 | 39.421 |
| 20.0 | 39.397 |
| 24.0 | 39.006 |
| 24.0 | 39.259 |
| 24.0 | 39.347 |
| 24.0 | 39.414 |
| 24.0 | 39.401 |
| 28.0 | 38.928 |
| 28.0 | 39.195 |
| 28.0 | 39.32 |
| 28.0 | 39.386 |
| 28.0 | 39.382 |
| 32.0 | 38.817 |
| 32.0 | 39.14 |
| 32.0 | 39.255 |
| 32.0 | 39.344 |
| 32.0 | 39.361 |
| 36.0 | 38.763 |
| 36.0 | 39.061 |
| 36.0 | 39.229 |
| 36.0 | 39.31 |
| 36.0 | 39.343 |
| 8.0 | 39.375 |
| 8.0 | 39.393 |
| 8.0 | 39.381 |
| 8.0 | 39.357 |
| 8.0 | 39.302 |
| 12.0 | 39.326 |
| 12.0 | 39.438 |
| 12.0 | 39.437 |
| 12.0 | 39.43 |
| 12.0 | 39.394 |
| 16.0 | 39.24 |
| 16.0 | 39.401 |
| 16.0 | 39.43 |
| 16.0 | 39.464 |
| 16.0 | 39.428 |
| 20.0 | 39.134 |
| 20.0 | 39.356 |
| 20.0 | 39.415 |
| 20.0 | 39.45 |
| 20.0 | 39.453 |
| 24.0 | 39.006 |
| 24.0 | 39.281 |
| 24.0 | 39.373 |
| 24.0 | 39.441 |
| 24.0 | 39.456 |
| 28.0 | 38.925 |
| 28.0 | 39.216 |
| 28.0 | 39.344 |
| 28.0 | 39.412 |
| 28.0 | 39.436 |
| 32.0 | 38.81 |
| 32.0 | 39.159 |
| 32.0 | 39.278 |
| 32.0 | 39.369 |
| 32.0 | 39.414 |
| 36.0 | 38.76 |
| 36.0 | 39.08 |
| 36.0 | 39.25 |
| 36.0 | 39.334 |
| 36.0 | 39.396 |
| 8.0 | 39.365 |
| 8.0 | 39.387 |
| 8.0 | 39.398 |
| 8.0 | 39.402 |
| 8.0 | 39.331 |
| 12.0 | 39.31 |
| 12.0 | 39.427 |
| 12.0 | 39.454 |
| 12.0 | 39.47 |
| 12.0 | 39.423 |
| 16.0 | 39.22 |
| 16.0 | 39.385 |
| 16.0 | 39.444 |
| 16.0 | 39.503 |
| 16.0 | 39.457 |
| 20.0 | 39.113 |
| 20.0 | 39.337 |
| 20.0 | 39.428 |
| 20.0 | 39.486 |
| 20.0 | 39.48 |
| 24.0 | 39.001 |
| 24.0 | 39.264 |
| 24.0 | 39.384 |
| 24.0 | 39.475 |
| 24.0 | 39.472 |
| 28.0 | 38.916 |
| 28.0 | 39.197 |
| 28.0 | 39.354 |
| 28.0 | 39.446 |
| 28.0 | 39.45 |
| 32.0 | 38.802 |
| 32.0 | 39.138 |
| 32.0 | 39.288 |
| 32.0 | 39.401 |
| 32.0 | 39.428 |
| 36.0 | 38.749 |
| 36.0 | 39.06 |
| 36.0 | 39.259 |
| 36.0 | 39.365 |
| 36.0 | 39.409 |
| 8.0 | 39.382 |
| 8.0 | 39.394 |
| 8.0 | 39.43 |
| 8.0 | 39.411 |
| 8.0 | 39.352 |
| 12.0 | 39.324 |
| 12.0 | 39.435 |
| 12.0 | 39.485 |
| 12.0 | 39.479 |
| 12.0 | 39.442 |
| 16.0 | 39.23 |
| 16.0 | 39.391 |
| 16.0 | 39.474 |
| 16.0 | 39.51 |
| 16.0 | 39.475 |
| 20.0 | 39.12 |
| 20.0 | 39.342 |
| 20.0 | 39.457 |
| 20.0 | 39.493 |
| 20.0 | 39.498 |
| 24.0 | 39.009 |
| 24.0 | 39.268 |
| 24.0 | 39.411 |
| 24.0 | 39.48 |
| 24.0 | 39.488 |
| 28.0 | 38.9 |
| 28.0 | 39.2 |
| 28.0 | 39.368 |
| 28.0 | 39.449 |
| 28.0 | 39.47 |
| 32.0 | 38.784 |
| 32.0 | 39.14 |
| 32.0 | 39.3 |
| 32.0 | 39.403 |
| 32.0 | 39.447 |
| 36.0 | 38.732 |
| 36.0 | 39.062 |
| 36.0 | 39.27 |
| 36.0 | 39.367 |
| 36.0 | 39.427 |
| 8.0 | 39.359 |
| 8.0 | 39.403 |
| 8.0 | 39.422 |
| 8.0 | 39.413 |
| 8.0 | 39.366 |
| 12.0 | 39.306 |
| 12.0 | 39.446 |
| 12.0 | 39.475 |
| 12.0 | 39.48 |
| 12.0 | 39.456 |
| 16.0 | 39.22 |
| 16.0 | 39.404 |
| 16.0 | 39.463 |
| 16.0 | 39.512 |
| 16.0 | 39.487 |
| 20.0 | 39.106 |
| 20.0 | 39.356 |
| 20.0 | 39.447 |
| 20.0 | 39.494 |
| 20.0 | 39.509 |
| 24.0 | 38.989 |
| 24.0 | 39.281 |
| 24.0 | 39.401 |
| 24.0 | 39.481 |
| 24.0 | 39.498 |
| 28.0 | 38.875 |
| 28.0 | 39.211 |
| 28.0 | 39.358 |
| 28.0 | 39.45 |
| 28.0 | 39.48 |
| 32.0 | 38.769 |
| 32.0 | 39.145 |
| 32.0 | 39.299 |
| 32.0 | 39.409 |
| 32.0 | 39.461 |
| 36.0 | 38.716 |
| 36.0 | 39.066 |
| 36.0 | 39.268 |
| 36.0 | 39.372 |
| 36.0 | 39.44 |
| 8.0 | 39.361 |
| 8.0 | 39.401 |
| 8.0 | 39.446 |
| 8.0 | 39.425 |
| 8.0 | 39.382 |
| 12.0 | 39.301 |
| 12.0 | 39.44 |
| 12.0 | 39.5 |
| 12.0 | 39.491 |
| 12.0 | 39.471 |
| 16.0 | 39.207 |
| 16.0 | 39.396 |
| 16.0 | 39.489 |
| 16.0 | 39.522 |
| 16.0 | 39.503 |
| 20.0 | 39.095 |
| 20.0 | 39.345 |
| 20.0 | 39.472 |
| 20.0 | 39.504 |
| 20.0 | 39.525 |
| 24.0 | 38.983 |
| 24.0 | 39.269 |
| 24.0 | 39.427 |
| 24.0 | 39.49 |
| 24.0 | 39.513 |
| 28.0 | 38.874 |
| 28.0 | 39.199 |
| 28.0 | 39.382 |
| 28.0 | 39.458 |
| 28.0 | 39.494 |
| 32.0 | 38.774 |
| 32.0 | 39.133 |
| 32.0 | 39.322 |
| 32.0 | 39.417 |
| 32.0 | 39.474 |
| 36.0 | 38.714 |
| 36.0 | 39.056 |
| 36.0 | 39.273 |
| 36.0 | 39.376 |
| 36.0 | 39.443 |
| 8.0 | 39.264 |
| 8.0 | 39.215 |
| 8.0 | 39.13 |
| 8.0 | 39.118 |
| 8.0 | 39.046 |
| 12.0 | 39.293 |
| 12.0 | 39.319 |
| 12.0 | 39.241 |
| 12.0 | 39.221 |
| 12.0 | 39.168 |
| 16.0 | 39.278 |
| 16.0 | 39.335 |
| 16.0 | 39.291 |
| 16.0 | 39.293 |
| 16.0 | 39.235 |
| 20.0 | 39.251 |
| 20.0 | 39.332 |
| 20.0 | 39.309 |
| 20.0 | 39.324 |
| 20.0 | 39.281 |
| 24.0 | 39.194 |
| 24.0 | 39.314 |
| 24.0 | 39.31 |
| 24.0 | 39.34 |
| 24.0 | 39.302 |
| 28.0 | 39.149 |
| 28.0 | 39.293 |
| 28.0 | 39.308 |
| 28.0 | 39.336 |
| 28.0 | 39.313 |
| 32.0 | 39.097 |
| 32.0 | 39.262 |
| 32.0 | 39.295 |
| 32.0 | 39.344 |
| 32.0 | 39.317 |
| 36.0 | 39.053 |
| 36.0 | 39.216 |
| 36.0 | 39.275 |
| 36.0 | 39.327 |
| 36.0 | 39.308 |
| 8.0 | 39.308 |
| 8.0 | 39.292 |
| 8.0 | 39.204 |
| 8.0 | 39.205 |
| 8.0 | 39.138 |
| 12.0 | 39.328 |
| 12.0 | 39.389 |
| 12.0 | 39.31 |
| 12.0 | 39.304 |
| 12.0 | 39.258 |
| 16.0 | 39.308 |
| 16.0 | 39.402 |
| 16.0 | 39.356 |
| 16.0 | 39.373 |
| 16.0 | 39.322 |
| 20.0 | 39.279 |
| 20.0 | 39.396 |
| 20.0 | 39.369 |
| 20.0 | 39.402 |
| 20.0 | 39.367 |
| 24.0 | 39.221 |
| 24.0 | 39.378 |
| 24.0 | 39.369 |
| 24.0 | 39.416 |
| 24.0 | 39.388 |
| 28.0 | 39.176 |
| 28.0 | 39.356 |
| 28.0 | 39.366 |
| 28.0 | 39.413 |
| 28.0 | 39.398 |
| 32.0 | 39.123 |
| 32.0 | 39.325 |
| 32.0 | 39.353 |
| 32.0 | 39.42 |
| 32.0 | 39.402 |
| 36.0 | 39.079 |
| 36.0 | 39.278 |
| 36.0 | 39.333 |
| 36.0 | 39.402 |
| 36.0 | 39.392 |
| 8.0 | 39.317 |
| 8.0 | 39.323 |
| 8.0 | 39.238 |
| 8.0 | 39.24 |
| 8.0 | 39.194 |
| 12.0 | 39.331 |
| 12.0 | 39.416 |
| 12.0 | 39.341 |
| 12.0 | 39.336 |
| 12.0 | 39.311 |
| 16.0 | 39.306 |
| 16.0 | 39.424 |
| 16.0 | 39.382 |
| 16.0 | 39.402 |
| 16.0 | 39.374 |
| 20.0 | 39.272 |
| 20.0 | 39.415 |
| 20.0 | 39.393 |
| 20.0 | 39.43 |
| 20.0 | 39.416 |
| 24.0 | 39.214 |
| 24.0 | 39.395 |
| 24.0 | 39.392 |
| 24.0 | 39.442 |
| 24.0 | 39.436 |
| 28.0 | 39.167 |
| 28.0 | 39.372 |
| 28.0 | 39.387 |
| 28.0 | 39.438 |
| 28.0 | 39.445 |
| 32.0 | 39.114 |
| 32.0 | 39.341 |
| 32.0 | 39.374 |
| 32.0 | 39.444 |
| 32.0 | 39.448 |
| 36.0 | 39.069 |
| 36.0 | 39.294 |
| 36.0 | 39.354 |
| 36.0 | 39.426 |
| 36.0 | 39.438 |
| 8.0 | 39.323 |
| 8.0 | 39.337 |
| 8.0 | 39.266 |
| 8.0 | 39.28 |
| 8.0 | 39.221 |
| 12.0 | 39.335 |
| 12.0 | 39.427 |
| 12.0 | 39.366 |
| 12.0 | 39.375 |
| 12.0 | 39.336 |
| 16.0 | 39.307 |
| 16.0 | 39.432 |
| 16.0 | 39.405 |
| 16.0 | 39.438 |
| 16.0 | 39.397 |
| 20.0 | 39.27 |
| 20.0 | 39.42 |
| 20.0 | 39.413 |
| 20.0 | 39.464 |
| 20.0 | 39.438 |
| 24.0 | 39.21 |
| 24.0 | 39.399 |
| 24.0 | 39.41 |
| 24.0 | 39.475 |
| 24.0 | 39.456 |
| 28.0 | 39.159 |
| 28.0 | 39.375 |
| 28.0 | 39.404 |
| 28.0 | 39.469 |
| 28.0 | 39.465 |
| 32.0 | 39.109 |
| 32.0 | 39.342 |
| 32.0 | 39.39 |
| 32.0 | 39.475 |
| 32.0 | 39.468 |
| 36.0 | 39.064 |
| 36.0 | 39.295 |
| 36.0 | 39.369 |
| 36.0 | 39.457 |
| 36.0 | 39.457 |
| 8.0 | 39.308 |
| 8.0 | 39.342 |
| 8.0 | 39.282 |
| 8.0 | 39.308 |
| 8.0 | 39.251 |
| 12.0 | 39.319 |
| 12.0 | 39.431 |
| 12.0 | 39.381 |
| 12.0 | 39.4 |
| 12.0 | 39.366 |
| 16.0 | 39.289 |
| 16.0 | 39.434 |
| 16.0 | 39.419 |
| 16.0 | 39.463 |
| 16.0 | 39.425 |
| 20.0 | 39.251 |
| 20.0 | 39.421 |
| 20.0 | 39.424 |
| 20.0 | 39.487 |
| 20.0 | 39.465 |
| 24.0 | 39.189 |
| 24.0 | 39.397 |
| 24.0 | 39.42 |
| 24.0 | 39.496 |
| 24.0 | 39.482 |
| 28.0 | 39.137 |
| 28.0 | 39.372 |
| 28.0 | 39.413 |
| 28.0 | 39.489 |
| 28.0 | 39.489 |
| 32.0 | 39.086 |
| 32.0 | 39.338 |
| 32.0 | 39.398 |
| 32.0 | 39.494 |
| 32.0 | 39.491 |
| 36.0 | 39.038 |
| 36.0 | 39.291 |
| 36.0 | 39.377 |
| 36.0 | 39.474 |
| 36.0 | 39.48 |
| 8.0 | 39.307 |
| 8.0 | 39.349 |
| 8.0 | 39.296 |
| 8.0 | 39.318 |
| 8.0 | 39.273 |
| 12.0 | 39.317 |
| 12.0 | 39.438 |
| 12.0 | 39.395 |
| 12.0 | 39.411 |
| 12.0 | 39.387 |
| 16.0 | 39.287 |
| 16.0 | 39.44 |
| 16.0 | 39.431 |
| 16.0 | 39.472 |
| 16.0 | 39.445 |
| 20.0 | 39.248 |
| 20.0 | 39.425 |
| 20.0 | 39.435 |
| 20.0 | 39.495 |
| 20.0 | 39.485 |
| 24.0 | 39.186 |
| 24.0 | 39.4 |
| 24.0 | 39.43 |
| 24.0 | 39.503 |
| 24.0 | 39.5 |
| 28.0 | 39.132 |
| 28.0 | 39.373 |
| 28.0 | 39.422 |
| 28.0 | 39.495 |
| 28.0 | 39.506 |
| 32.0 | 39.08 |
| 32.0 | 39.339 |
| 32.0 | 39.405 |
| 32.0 | 39.498 |
| 32.0 | 39.508 |
| 36.0 | 39.031 |
| 36.0 | 39.291 |
| 36.0 | 39.384 |
| 36.0 | 39.479 |
| 36.0 | 39.496 |
| 8.0 | 39.301 |
| 8.0 | 39.349 |
| 8.0 | 39.304 |
| 8.0 | 39.341 |
| 8.0 | 39.29 |
| 12.0 | 39.311 |
| 12.0 | 39.438 |
| 12.0 | 39.401 |
| 12.0 | 39.432 |
| 12.0 | 39.404 |
| 16.0 | 39.28 |
| 16.0 | 39.439 |
| 16.0 | 39.437 |
| 16.0 | 39.489 |
| 16.0 | 39.461 |
| 20.0 | 39.241 |
| 20.0 | 39.424 |
| 20.0 | 39.44 |
| 20.0 | 39.515 |
| 20.0 | 39.5 |
| 24.0 | 39.178 |
| 24.0 | 39.398 |
| 24.0 | 39.434 |
| 24.0 | 39.522 |
| 24.0 | 39.515 |
| 28.0 | 39.124 |
| 28.0 | 39.37 |
| 28.0 | 39.425 |
| 28.0 | 39.513 |
| 28.0 | 39.52 |
| 32.0 | 39.071 |
| 32.0 | 39.335 |
| 32.0 | 39.408 |
| 32.0 | 39.516 |
| 32.0 | 39.521 |
| 36.0 | 39.022 |
| 36.0 | 39.286 |
| 36.0 | 39.385 |
| 36.0 | 39.496 |
| 36.0 | 39.509 |
| 8.0 | 39.298 |
| 8.0 | 39.337 |
| 8.0 | 39.307 |
| 8.0 | 39.341 |
| 8.0 | 39.294 |
| 12.0 | 39.308 |
| 12.0 | 39.425 |
| 12.0 | 39.404 |
| 12.0 | 39.432 |
| 12.0 | 39.408 |
| 16.0 | 39.277 |
| 16.0 | 39.426 |
| 16.0 | 39.439 |
| 16.0 | 39.488 |
| 16.0 | 39.465 |
| 20.0 | 39.237 |
| 20.0 | 39.41 |
| 20.0 | 39.442 |
| 20.0 | 39.51 |
| 20.0 | 39.504 |
| 24.0 | 39.174 |
| 24.0 | 39.384 |
| 24.0 | 39.436 |
| 24.0 | 39.52 |
| 24.0 | 39.518 |
| 28.0 | 39.119 |
| 28.0 | 39.356 |
| 28.0 | 39.426 |
| 28.0 | 39.51 |
| 28.0 | 39.523 |
| 32.0 | 39.066 |
| 32.0 | 39.321 |
| 32.0 | 39.408 |
| 32.0 | 39.513 |
| 32.0 | 39.522 |
| 36.0 | 39.016 |
| 36.0 | 39.272 |
| 36.0 | 39.385 |
| 36.0 | 39.493 |
| 36.0 | 39.51 |
| 8.0 | 39.176 |
| 8.0 | 39.111 |
| 8.0 | 39.074 |
| 8.0 | 39.046 |
| 8.0 | 38.998 |
| 12.0 | 39.205 |
| 12.0 | 39.215 |
| 12.0 | 39.181 |
| 12.0 | 39.157 |
| 12.0 | 39.125 |
| 16.0 | 39.189 |
| 16.0 | 39.229 |
| 16.0 | 39.227 |
| 16.0 | 39.235 |
| 16.0 | 39.193 |
| 20.0 | 39.137 |
| 20.0 | 39.23 |
| 20.0 | 39.254 |
| 20.0 | 39.253 |
| 20.0 | 39.247 |
| 24.0 | 39.089 |
| 24.0 | 39.203 |
| 24.0 | 39.251 |
| 24.0 | 39.276 |
| 24.0 | 39.265 |
| 28.0 | 39.032 |
| 28.0 | 39.172 |
| 28.0 | 39.24 |
| 28.0 | 39.274 |
| 28.0 | 39.271 |
| 32.0 | 38.977 |
| 32.0 | 39.141 |
| 32.0 | 39.215 |
| 32.0 | 39.263 |
| 32.0 | 39.274 |
| 36.0 | 38.934 |
| 36.0 | 39.095 |
| 36.0 | 39.193 |
| 36.0 | 39.25 |
| 36.0 | 39.273 |
| 8.0 | 39.171 |
| 8.0 | 39.167 |
| 8.0 | 39.142 |
| 8.0 | 39.094 |
| 8.0 | 39.035 |
| 12.0 | 39.19 |
| 12.0 | 39.268 |
| 12.0 | 39.244 |
| 12.0 | 39.21 |
| 12.0 | 39.162 |
| 16.0 | 39.165 |
| 16.0 | 39.277 |
| 16.0 | 39.287 |
| 16.0 | 39.281 |
| 16.0 | 39.226 |
| 20.0 | 39.115 |
| 20.0 | 39.277 |
| 20.0 | 39.313 |
| 20.0 | 39.298 |
| 20.0 | 39.279 |
| 24.0 | 39.063 |
| 24.0 | 39.244 |
| 24.0 | 39.309 |
| 24.0 | 39.319 |
| 24.0 | 39.298 |
| 28.0 | 39.005 |
| 28.0 | 39.213 |
| 28.0 | 39.299 |
| 28.0 | 39.316 |
| 28.0 | 39.302 |
| 32.0 | 38.951 |
| 32.0 | 39.184 |
| 32.0 | 39.271 |
| 32.0 | 39.306 |
| 32.0 | 39.305 |
| 36.0 | 38.906 |
| 36.0 | 39.138 |
| 36.0 | 39.248 |
| 36.0 | 39.292 |
| 36.0 | 39.305 |
| 8.0 | 39.145 |
| 8.0 | 39.159 |
| 8.0 | 39.153 |
| 8.0 | 39.142 |
| 8.0 | 39.08 |
| 12.0 | 39.157 |
| 12.0 | 39.25 |
| 12.0 | 39.254 |
| 12.0 | 39.254 |
| 12.0 | 39.199 |
| 16.0 | 39.129 |
| 16.0 | 39.256 |
| 16.0 | 39.289 |
| 16.0 | 39.322 |
| 16.0 | 39.266 |
| 20.0 | 39.075 |
| 20.0 | 39.252 |
| 20.0 | 39.311 |
| 20.0 | 39.337 |
| 20.0 | 39.316 |
| 24.0 | 39.022 |
| 24.0 | 39.221 |
| 24.0 | 39.305 |
| 24.0 | 39.357 |
| 24.0 | 39.332 |
| 28.0 | 38.962 |
| 28.0 | 39.188 |
| 28.0 | 39.296 |
| 28.0 | 39.354 |
| 28.0 | 39.337 |
| 32.0 | 38.905 |
| 32.0 | 39.159 |
| 32.0 | 39.266 |
| 32.0 | 39.342 |
| 32.0 | 39.339 |
| 36.0 | 38.864 |
| 36.0 | 39.112 |
| 36.0 | 39.242 |
| 36.0 | 39.329 |
| 36.0 | 39.338 |
| 8.0 | 39.107 |
| 8.0 | 39.158 |
| 8.0 | 39.162 |
| 8.0 | 39.142 |
| 8.0 | 39.115 |
| 12.0 | 39.113 |
| 12.0 | 39.244 |
| 12.0 | 39.26 |
| 12.0 | 39.252 |
| 12.0 | 39.233 |
| 16.0 | 39.081 |
| 16.0 | 39.244 |
| 16.0 | 39.291 |
| 16.0 | 39.318 |
| 16.0 | 39.297 |
| 20.0 | 39.023 |
| 20.0 | 39.237 |
| 20.0 | 39.31 |
| 20.0 | 39.331 |
| 20.0 | 39.346 |
| 24.0 | 38.967 |
| 24.0 | 39.204 |
| 24.0 | 39.303 |
| 24.0 | 39.349 |
| 24.0 | 39.36 |
| 28.0 | 38.905 |
| 28.0 | 39.17 |
| 28.0 | 39.294 |
| 28.0 | 39.344 |
| 28.0 | 39.364 |
| 32.0 | 38.849 |
| 32.0 | 39.14 |
| 32.0 | 39.264 |
| 32.0 | 39.331 |
| 32.0 | 39.366 |
| 36.0 | 38.808 |
| 36.0 | 39.093 |
| 36.0 | 39.239 |
| 36.0 | 39.317 |
| 36.0 | 39.364 |
| 8.0 | 39.091 |
| 8.0 | 39.13 |
| 8.0 | 39.15 |
| 8.0 | 39.154 |
| 8.0 | 39.115 |
| 12.0 | 39.097 |
| 12.0 | 39.215 |
| 12.0 | 39.246 |
| 12.0 | 39.258 |
| 12.0 | 39.236 |
| 16.0 | 39.066 |
| 16.0 | 39.214 |
| 16.0 | 39.275 |
| 16.0 | 39.322 |
| 16.0 | 39.292 |
| 20.0 | 39.008 |
| 20.0 | 39.207 |
| 20.0 | 39.293 |
| 20.0 | 39.333 |
| 20.0 | 39.345 |
| 24.0 | 38.944 |
| 24.0 | 39.17 |
| 24.0 | 39.284 |
| 24.0 | 39.35 |
| 24.0 | 39.357 |
| 28.0 | 38.88 |
| 28.0 | 39.134 |
| 28.0 | 39.275 |
| 28.0 | 39.344 |
| 28.0 | 39.361 |
| 32.0 | 38.823 |
| 32.0 | 39.103 |
| 32.0 | 39.245 |
| 32.0 | 39.331 |
| 32.0 | 39.362 |
| 36.0 | 38.78 |
| 36.0 | 39.055 |
| 36.0 | 39.22 |
| 36.0 | 39.316 |
| 36.0 | 39.359 |
| 8.0 | 39.084 |
| 8.0 | 39.111 |
| 8.0 | 39.161 |
| 8.0 | 39.154 |
| 8.0 | 39.116 |
| 12.0 | 39.089 |
| 12.0 | 39.194 |
| 12.0 | 39.251 |
| 12.0 | 39.256 |
| 12.0 | 39.234 |
| 16.0 | 39.055 |
| 16.0 | 39.19 |
| 16.0 | 39.274 |
| 16.0 | 39.318 |
| 16.0 | 39.288 |
| 20.0 | 38.996 |
| 20.0 | 39.181 |
| 20.0 | 39.289 |
| 20.0 | 39.329 |
| 20.0 | 39.339 |
| 24.0 | 38.93 |
| 24.0 | 39.142 |
| 24.0 | 39.275 |
| 24.0 | 39.343 |
| 24.0 | 39.349 |
| 28.0 | 38.865 |
| 28.0 | 39.105 |
| 28.0 | 39.261 |
| 28.0 | 39.336 |
| 28.0 | 39.353 |
| 32.0 | 38.808 |
| 32.0 | 39.073 |
| 32.0 | 39.231 |
| 32.0 | 39.322 |
| 32.0 | 39.353 |
| 36.0 | 38.766 |
| 36.0 | 39.024 |
| 36.0 | 39.205 |
| 36.0 | 39.307 |
| 36.0 | 39.35 |
| 8.0 | 39.082 |
| 8.0 | 39.105 |
| 8.0 | 39.137 |
| 8.0 | 39.144 |
| 8.0 | 39.122 |
| 12.0 | 39.084 |
| 12.0 | 39.186 |
| 12.0 | 39.225 |
| 12.0 | 39.244 |
| 12.0 | 39.24 |
| 16.0 | 39.042 |
| 16.0 | 39.18 |
| 16.0 | 39.248 |
| 16.0 | 39.306 |
| 16.0 | 39.293 |
| 20.0 | 38.98 |
| 20.0 | 39.169 |
| 20.0 | 39.263 |
| 20.0 | 39.315 |
| 20.0 | 39.342 |
| 24.0 | 38.913 |
| 24.0 | 39.129 |
| 24.0 | 39.251 |
| 24.0 | 39.328 |
| 24.0 | 39.352 |
| 28.0 | 38.847 |
| 28.0 | 39.091 |
| 28.0 | 39.236 |
| 28.0 | 39.32 |
| 28.0 | 39.355 |
| 32.0 | 38.792 |
| 32.0 | 39.054 |
| 32.0 | 39.205 |
| 32.0 | 39.306 |
| 32.0 | 39.353 |
| 36.0 | 38.748 |
| 36.0 | 39.008 |
| 36.0 | 39.174 |
| 36.0 | 39.29 |
| 36.0 | 39.348 |
| 8.0 | 39.081 |
| 8.0 | 39.094 |
| 8.0 | 39.121 |
| 8.0 | 39.138 |
| 8.0 | 39.117 |
| 12.0 | 39.076 |
| 12.0 | 39.174 |
| 12.0 | 39.209 |
| 12.0 | 39.237 |
| 12.0 | 39.235 |
| 16.0 | 39.035 |
| 16.0 | 39.168 |
| 16.0 | 39.232 |
| 16.0 | 39.297 |
| 16.0 | 39.289 |
| 20.0 | 38.971 |
| 20.0 | 39.156 |
| 20.0 | 39.246 |
| 20.0 | 39.305 |
| 20.0 | 39.339 |
| 24.0 | 38.904 |
| 24.0 | 39.115 |
| 24.0 | 39.234 |
| 24.0 | 39.318 |
| 24.0 | 39.348 |
| 28.0 | 38.836 |
| 28.0 | 39.076 |
| 28.0 | 39.219 |
| 28.0 | 39.31 |
| 28.0 | 39.352 |
| 32.0 | 38.78 |
| 32.0 | 39.042 |
| 32.0 | 39.186 |
| 32.0 | 39.294 |
| 32.0 | 39.349 |
| 36.0 | 38.737 |
| 36.0 | 38.991 |
| 36.0 | 39.158 |
| 36.0 | 39.277 |
| 36.0 | 39.336 |
| 8.0 | 38.992 |
| 8.0 | 39.001 |
| 8.0 | 38.974 |
| 8.0 | 38.928 |
| 8.0 | 38.875 |
| 12.0 | 38.978 |
| 12.0 | 39.044 |
| 12.0 | 39.046 |
| 12.0 | 39.014 |
| 12.0 | 38.985 |
| 16.0 | 38.931 |
| 16.0 | 39.043 |
| 16.0 | 39.07 |
| 16.0 | 39.057 |
| 16.0 | 39.045 |
| 20.0 | 38.875 |
| 20.0 | 39.024 |
| 20.0 | 39.071 |
| 20.0 | 39.088 |
| 20.0 | 39.077 |
| 24.0 | 38.854 |
| 24.0 | 38.987 |
| 24.0 | 39.043 |
| 24.0 | 39.09 |
| 24.0 | 39.091 |
| 28.0 | 38.846 |
| 28.0 | 38.946 |
| 28.0 | 39.03 |
| 28.0 | 39.072 |
| 28.0 | 39.081 |
| 32.0 | 38.802 |
| 32.0 | 38.935 |
| 32.0 | 39.004 |
| 32.0 | 39.049 |
| 32.0 | 39.065 |
| 36.0 | 38.799 |
| 36.0 | 38.913 |
| 36.0 | 38.98 |
| 36.0 | 39.028 |
| 36.0 | 39.052 |
| 8.0 | 38.917 |
| 8.0 | 38.982 |
| 8.0 | 38.979 |
| 8.0 | 38.95 |
| 8.0 | 38.903 |
| 12.0 | 38.895 |
| 12.0 | 39.016 |
| 12.0 | 39.046 |
| 12.0 | 39.046 |
| 12.0 | 39.006 |
| 16.0 | 38.841 |
| 16.0 | 39.005 |
| 16.0 | 39.064 |
| 16.0 | 39.086 |
| 16.0 | 39.063 |
| 20.0 | 38.78 |
| 20.0 | 38.987 |
| 20.0 | 39.063 |
| 20.0 | 39.116 |
| 20.0 | 39.095 |
| 24.0 | 38.756 |
| 24.0 | 38.948 |
| 24.0 | 39.036 |
| 24.0 | 39.116 |
| 24.0 | 39.109 |
| 28.0 | 38.742 |
| 28.0 | 38.9 |
| 28.0 | 39.022 |
| 28.0 | 39.097 |
| 28.0 | 39.097 |
| 32.0 | 38.699 |
| 32.0 | 38.891 |
| 32.0 | 38.994 |
| 32.0 | 39.072 |
| 32.0 | 39.081 |
| 36.0 | 38.694 |
| 36.0 | 38.867 |
| 36.0 | 38.969 |
| 36.0 | 39.048 |
| 36.0 | 39.067 |
| 8.0 | 38.873 |
| 8.0 | 38.933 |
| 8.0 | 38.956 |
| 8.0 | 38.95 |
| 8.0 | 38.918 |
| 12.0 | 38.84 |
| 12.0 | 38.957 |
| 12.0 | 39.019 |
| 12.0 | 39.043 |
| 12.0 | 39.017 |
| 16.0 | 38.78 |
| 16.0 | 38.956 |
| 16.0 | 39.044 |
| 16.0 | 39.08 |
| 16.0 | 39.077 |
| 20.0 | 38.715 |
| 20.0 | 38.935 |
| 20.0 | 39.039 |
| 20.0 | 39.108 |
| 20.0 | 39.106 |
| 24.0 | 38.689 |
| 24.0 | 38.894 |
| 24.0 | 39.011 |
| 24.0 | 39.107 |
| 24.0 | 39.119 |
| 28.0 | 38.669 |
| 28.0 | 38.844 |
| 28.0 | 38.995 |
| 28.0 | 39.083 |
| 28.0 | 39.107 |
| 32.0 | 38.627 |
| 32.0 | 38.833 |
| 32.0 | 38.966 |
| 32.0 | 39.056 |
| 32.0 | 39.09 |
| 36.0 | 38.621 |
| 36.0 | 38.808 |
| 36.0 | 38.94 |
| 36.0 | 39.036 |
| 36.0 | 39.075 |
| 8.0 | 38.826 |
| 8.0 | 38.922 |
| 8.0 | 38.925 |
| 8.0 | 38.952 |
| 8.0 | 38.914 |
| 12.0 | 38.784 |
| 12.0 | 38.937 |
| 12.0 | 38.984 |
| 12.0 | 39.04 |
| 12.0 | 39.011 |
| 16.0 | 38.718 |
| 16.0 | 38.93 |
| 16.0 | 39.005 |
| 16.0 | 39.075 |
| 16.0 | 39.069 |
| 20.0 | 38.662 |
| 20.0 | 38.893 |
| 20.0 | 38.997 |
| 20.0 | 39.085 |
| 20.0 | 39.096 |
| 24.0 | 38.633 |
| 24.0 | 38.849 |
| 24.0 | 38.967 |
| 24.0 | 39.078 |
| 24.0 | 39.107 |
| 28.0 | 38.61 |
| 28.0 | 38.798 |
| 28.0 | 38.946 |
| 28.0 | 39.056 |
| 28.0 | 39.094 |
| 32.0 | 38.566 |
| 32.0 | 38.784 |
| 32.0 | 38.92 |
| 32.0 | 39.029 |
| 32.0 | 39.076 |
| 36.0 | 38.558 |
| 36.0 | 38.758 |
| 36.0 | 38.893 |
| 36.0 | 39.008 |
| 36.0 | 39.061 |
| 8.0 | 38.797 |
| 8.0 | 38.9 |
| 8.0 | 38.896 |
| 8.0 | 38.933 |
| 8.0 | 38.911 |
| 12.0 | 38.752 |
| 12.0 | 38.909 |
| 12.0 | 38.949 |
| 12.0 | 39.017 |
| 12.0 | 39.005 |
| 16.0 | 38.681 |
| 16.0 | 38.897 |
| 16.0 | 38.967 |
| 16.0 | 39.046 |
| 16.0 | 39.062 |
| 20.0 | 38.62 |
| 20.0 | 38.857 |
| 20.0 | 38.956 |
| 20.0 | 39.054 |
| 20.0 | 39.087 |
| 24.0 | 38.584 |
| 24.0 | 38.81 |
| 24.0 | 38.919 |
| 24.0 | 39.049 |
| 24.0 | 39.091 |
| 28.0 | 38.558 |
| 28.0 | 38.758 |
| 28.0 | 38.9 |
| 28.0 | 39.025 |
| 28.0 | 39.076 |
| 32.0 | 38.514 |
| 32.0 | 38.743 |
| 32.0 | 38.873 |
| 32.0 | 38.997 |
| 32.0 | 39.057 |
| 36.0 | 38.504 |
| 36.0 | 38.717 |
| 36.0 | 38.845 |
| 36.0 | 38.975 |
| 36.0 | 39.042 |
| 8.0 | 38.814 |
| 8.0 | 38.859 |
| 8.0 | 38.891 |
| 8.0 | 38.905 |
| 8.0 | 38.885 |
| 12.0 | 38.764 |
| 12.0 | 38.866 |
| 12.0 | 38.94 |
| 12.0 | 38.983 |
| 12.0 | 38.976 |
| 16.0 | 38.692 |
| 16.0 | 38.851 |
| 16.0 | 38.953 |
| 16.0 | 39.01 |
| 16.0 | 39.03 |
| 20.0 | 38.626 |
| 20.0 | 38.809 |
| 20.0 | 38.94 |
| 20.0 | 39.015 |
| 20.0 | 39.053 |
| 24.0 | 38.589 |
| 24.0 | 38.762 |
| 24.0 | 38.902 |
| 24.0 | 39.008 |
| 24.0 | 39.056 |
| 28.0 | 38.548 |
| 28.0 | 38.717 |
| 28.0 | 38.881 |
| 28.0 | 38.984 |
| 28.0 | 39.049 |
| 32.0 | 38.503 |
| 32.0 | 38.7 |
| 32.0 | 38.852 |
| 32.0 | 38.954 |
| 32.0 | 39.024 |
| 36.0 | 38.492 |
| 36.0 | 38.673 |
| 36.0 | 38.823 |
| 36.0 | 38.93 |
| 36.0 | 39.008 |
| 8.0 | 38.796 |
| 8.0 | 38.856 |
| 8.0 | 38.885 |
| 8.0 | 38.888 |
| 8.0 | 38.86 |
| 12.0 | 38.748 |
| 12.0 | 38.863 |
| 12.0 | 38.931 |
| 12.0 | 38.963 |
| 12.0 | 38.946 |
| 16.0 | 38.674 |
| 16.0 | 38.845 |
| 16.0 | 38.94 |
| 16.0 | 38.992 |
| 16.0 | 38.999 |
| 20.0 | 38.608 |
| 20.0 | 38.799 |
| 20.0 | 38.922 |
| 20.0 | 38.992 |
| 20.0 | 39.02 |
| 24.0 | 38.569 |
| 24.0 | 38.748 |
| 24.0 | 38.886 |
| 24.0 | 38.984 |
| 24.0 | 39.022 |
| 28.0 | 38.526 |
| 28.0 | 38.701 |
| 28.0 | 38.862 |
| 28.0 | 38.959 |
| 28.0 | 39.01 |
| 32.0 | 38.489 |
| 32.0 | 38.668 |
| 32.0 | 38.821 |
| 32.0 | 38.941 |
| 32.0 | 38.987 |
| 36.0 | 38.477 |
| 36.0 | 38.64 |
| 36.0 | 38.791 |
| 36.0 | 38.917 |
| 36.0 | 38.97 |
| 8.0 | 38.802 |
| 8.0 | 38.835 |
| 8.0 | 38.87 |
| 8.0 | 38.886 |
| 8.0 | 38.854 |
| 12.0 | 38.752 |
| 12.0 | 38.84 |
| 12.0 | 38.912 |
| 12.0 | 38.958 |
| 12.0 | 38.939 |
| 16.0 | 38.676 |
| 16.0 | 38.819 |
| 16.0 | 38.919 |
| 16.0 | 38.985 |
| 16.0 | 38.989 |
| 20.0 | 38.608 |
| 20.0 | 38.771 |
| 20.0 | 38.899 |
| 20.0 | 38.98 |
| 20.0 | 39.009 |
| 24.0 | 38.567 |
| 24.0 | 38.718 |
| 24.0 | 38.862 |
| 24.0 | 38.97 |
| 24.0 | 39.01 |
| 28.0 | 38.523 |
| 28.0 | 38.669 |
| 28.0 | 38.837 |
| 28.0 | 38.943 |
| 28.0 | 38.997 |
| 32.0 | 38.485 |
| 32.0 | 38.635 |
| 32.0 | 38.795 |
| 32.0 | 38.924 |
| 32.0 | 38.972 |
| 36.0 | 38.462 |
| 36.0 | 38.606 |
| 36.0 | 38.764 |
| 36.0 | 38.886 |
| 36.0 | 38.948 |
| 8.0 | 38.864 |
| 8.0 | 38.869 |
| 8.0 | 38.888 |
| 8.0 | 38.839 |
| 8.0 | 38.791 |
| 12.0 | 38.866 |
| 12.0 | 38.942 |
| 12.0 | 38.966 |
| 12.0 | 38.949 |
| 12.0 | 38.906 |
| 16.0 | 38.858 |
| 16.0 | 38.934 |
| 16.0 | 38.977 |
| 16.0 | 38.997 |
| 16.0 | 38.952 |
| 20.0 | 38.847 |
| 20.0 | 38.939 |
| 20.0 | 38.987 |
| 20.0 | 38.987 |
| 20.0 | 38.99 |
| 24.0 | 38.824 |
| 24.0 | 38.908 |
| 24.0 | 38.976 |
| 24.0 | 38.997 |
| 24.0 | 38.986 |
| 28.0 | 38.801 |
| 28.0 | 38.904 |
| 28.0 | 38.972 |
| 28.0 | 38.983 |
| 28.0 | 38.981 |
| 32.0 | 38.805 |
| 32.0 | 38.901 |
| 32.0 | 38.947 |
| 32.0 | 38.976 |
| 32.0 | 38.972 |
| 36.0 | 38.804 |
| 36.0 | 38.882 |
| 36.0 | 38.944 |
| 36.0 | 38.962 |
| 36.0 | 38.963 |
| 8.0 | 38.766 |
| 8.0 | 38.823 |
| 8.0 | 38.866 |
| 8.0 | 38.845 |
| 8.0 | 38.819 |
| 12.0 | 38.754 |
| 12.0 | 38.884 |
| 12.0 | 38.938 |
| 12.0 | 38.942 |
| 12.0 | 38.932 |
| 16.0 | 38.738 |
| 16.0 | 38.87 |
| 16.0 | 38.941 |
| 16.0 | 38.99 |
| 16.0 | 38.975 |
| 20.0 | 38.721 |
| 20.0 | 38.874 |
| 20.0 | 38.951 |
| 20.0 | 38.978 |
| 20.0 | 39.008 |
| 24.0 | 38.692 |
| 24.0 | 38.838 |
| 24.0 | 38.937 |
| 24.0 | 38.985 |
| 24.0 | 39.002 |
| 28.0 | 38.667 |
| 28.0 | 38.833 |
| 28.0 | 38.932 |
| 28.0 | 38.969 |
| 28.0 | 39 |
| 32.0 | 38.673 |
| 32.0 | 38.826 |
| 32.0 | 38.904 |
| 32.0 | 38.959 |
| 32.0 | 38.99 |
| 36.0 | 38.668 |
| 36.0 | 38.805 |
| 36.0 | 38.9 |
| 36.0 | 38.943 |
| 36.0 | 38.978 |
| 8.0 | 38.714 |
| 8.0 | 38.764 |
| 8.0 | 38.798 |
| 8.0 | 38.827 |
| 8.0 | 38.794 |
| 12.0 | 38.684 |
| 12.0 | 38.813 |
| 12.0 | 38.859 |
| 12.0 | 38.919 |
| 12.0 | 38.903 |
| 16.0 | 38.654 |
| 16.0 | 38.793 |
| 16.0 | 38.862 |
| 16.0 | 38.963 |
| 16.0 | 38.945 |
| 20.0 | 38.631 |
| 20.0 | 38.793 |
| 20.0 | 38.867 |
| 20.0 | 38.949 |
| 20.0 | 38.979 |
| 24.0 | 38.603 |
| 24.0 | 38.754 |
| 24.0 | 38.851 |
| 24.0 | 38.951 |
| 24.0 | 38.972 |
| 28.0 | 38.573 |
| 28.0 | 38.745 |
| 28.0 | 38.842 |
| 28.0 | 38.936 |
| 28.0 | 38.968 |
| 32.0 | 38.576 |
| 32.0 | 38.738 |
| 32.0 | 38.811 |
| 32.0 | 38.925 |
| 32.0 | 38.956 |
| 36.0 | 38.574 |
| 36.0 | 38.714 |
| 36.0 | 38.807 |
| 36.0 | 38.906 |
| 36.0 | 38.944 |
| 8.0 | 38.699 |
| 8.0 | 38.73 |
| 8.0 | 38.771 |
| 8.0 | 38.764 |
| 8.0 | 38.775 |
| 12.0 | 38.656 |
| 12.0 | 38.769 |
| 12.0 | 38.828 |
| 12.0 | 38.851 |
| 12.0 | 38.88 |
| 16.0 | 38.615 |
| 16.0 | 38.741 |
| 16.0 | 38.824 |
| 16.0 | 38.892 |
| 16.0 | 38.919 |
| 20.0 | 38.583 |
| 20.0 | 38.734 |
| 20.0 | 38.827 |
| 20.0 | 38.874 |
| 20.0 | 38.95 |
| 24.0 | 38.554 |
| 24.0 | 38.692 |
| 24.0 | 38.808 |
| 24.0 | 38.877 |
| 24.0 | 38.941 |
| 28.0 | 38.518 |
| 28.0 | 38.682 |
| 28.0 | 38.799 |
| 28.0 | 38.861 |
| 28.0 | 38.937 |
| 32.0 | 38.523 |
| 32.0 | 38.672 |
| 32.0 | 38.765 |
| 32.0 | 38.848 |
| 32.0 | 38.924 |
| 36.0 | 38.522 |
| 36.0 | 38.648 |
| 36.0 | 38.761 |
| 36.0 | 38.828 |
| 36.0 | 38.911 |
| 8.0 | 38.672 |
| 8.0 | 38.694 |
| 8.0 | 38.74 |
| 8.0 | 38.752 |
| 8.0 | 38.732 |
| 12.0 | 38.625 |
| 12.0 | 38.723 |
| 12.0 | 38.788 |
| 12.0 | 38.83 |
| 12.0 | 38.832 |
| 16.0 | 38.576 |
| 16.0 | 38.687 |
| 16.0 | 38.778 |
| 16.0 | 38.863 |
| 16.0 | 38.868 |
| 20.0 | 38.544 |
| 20.0 | 38.674 |
| 20.0 | 38.777 |
| 20.0 | 38.846 |
| 20.0 | 38.897 |
| 24.0 | 38.512 |
| 24.0 | 38.629 |
| 24.0 | 38.755 |
| 24.0 | 38.847 |
| 24.0 | 38.887 |
| 28.0 | 38.476 |
| 28.0 | 38.616 |
| 28.0 | 38.741 |
| 28.0 | 38.829 |
| 28.0 | 38.88 |
| 32.0 | 38.478 |
| 32.0 | 38.605 |
| 32.0 | 38.71 |
| 32.0 | 38.815 |
| 32.0 | 38.866 |
| 36.0 | 38.476 |
| 36.0 | 38.578 |
| 36.0 | 38.7 |
| 36.0 | 38.794 |
| 36.0 | 38.852 |
| 8.0 | 38.656 |
| 8.0 | 38.692 |
| 8.0 | 38.714 |
| 8.0 | 38.732 |
| 8.0 | 38.714 |
| 12.0 | 38.607 |
| 12.0 | 38.717 |
| 12.0 | 38.758 |
| 12.0 | 38.803 |
| 12.0 | 38.806 |
| 16.0 | 38.555 |
| 16.0 | 38.675 |
| 16.0 | 38.744 |
| 16.0 | 38.834 |
| 16.0 | 38.838 |
| 20.0 | 38.519 |
| 20.0 | 38.656 |
| 20.0 | 38.736 |
| 20.0 | 38.814 |
| 20.0 | 38.865 |
| 24.0 | 38.48 |
| 24.0 | 38.607 |
| 24.0 | 38.714 |
| 24.0 | 38.814 |
| 24.0 | 38.852 |
| 28.0 | 38.444 |
| 28.0 | 38.59 |
| 28.0 | 38.698 |
| 28.0 | 38.79 |
| 28.0 | 38.845 |
| 32.0 | 38.446 |
| 32.0 | 38.576 |
| 32.0 | 38.662 |
| 32.0 | 38.774 |
| 32.0 | 38.83 |
| 36.0 | 38.443 |
| 36.0 | 38.549 |
| 36.0 | 38.655 |
| 36.0 | 38.752 |
| 36.0 | 38.815 |
| 8.0 | 38.647 |
| 8.0 | 38.686 |
| 8.0 | 38.697 |
| 8.0 | 38.711 |
| 8.0 | 38.702 |
| 12.0 | 38.595 |
| 12.0 | 38.71 |
| 12.0 | 38.733 |
| 12.0 | 38.775 |
| 12.0 | 38.791 |
| 16.0 | 38.538 |
| 16.0 | 38.665 |
| 16.0 | 38.711 |
| 16.0 | 38.801 |
| 16.0 | 38.817 |
| 20.0 | 38.499 |
| 20.0 | 38.642 |
| 20.0 | 38.701 |
| 20.0 | 38.776 |
| 20.0 | 38.841 |
| 24.0 | 38.461 |
| 24.0 | 38.589 |
| 24.0 | 38.673 |
| 24.0 | 38.773 |
| 24.0 | 38.827 |
| 28.0 | 38.423 |
| 28.0 | 38.569 |
| 28.0 | 38.654 |
| 28.0 | 38.748 |
| 28.0 | 38.818 |
| 32.0 | 38.414 |
| 32.0 | 38.555 |
| 32.0 | 38.616 |
| 32.0 | 38.729 |
| 32.0 | 38.801 |
| 36.0 | 38.41 |
| 36.0 | 38.526 |
| 36.0 | 38.607 |
| 36.0 | 38.706 |
| 36.0 | 38.786 |
| 8.0 | 38.624 |
| 8.0 | 38.67 |
| 8.0 | 38.688 |
| 8.0 | 38.682 |
| 8.0 | 38.687 |
| 12.0 | 38.569 |
| 12.0 | 38.691 |
| 12.0 | 38.728 |
| 12.0 | 38.743 |
| 12.0 | 38.771 |
| 16.0 | 38.513 |
| 16.0 | 38.645 |
| 16.0 | 38.705 |
| 16.0 | 38.767 |
| 16.0 | 38.795 |
| 20.0 | 38.475 |
| 20.0 | 38.62 |
| 20.0 | 38.69 |
| 20.0 | 38.741 |
| 20.0 | 38.814 |
| 24.0 | 38.436 |
| 24.0 | 38.565 |
| 24.0 | 38.661 |
| 24.0 | 38.734 |
| 24.0 | 38.798 |
| 28.0 | 38.396 |
| 28.0 | 38.542 |
| 28.0 | 38.64 |
| 28.0 | 38.708 |
| 28.0 | 38.787 |
| 32.0 | 38.384 |
| 32.0 | 38.526 |
| 32.0 | 38.6 |
| 32.0 | 38.688 |
| 32.0 | 38.77 |
| 36.0 | 38.387 |
| 36.0 | 38.496 |
| 36.0 | 38.591 |
| 36.0 | 38.668 |
| 36.0 | 38.749 |
| 8.0 | 38.813 |
| 8.0 | 38.804 |
| 8.0 | 38.792 |
| 8.0 | 38.803 |
| 8.0 | 38.747 |
| 12.0 | 38.818 |
| 12.0 | 38.887 |
| 12.0 | 38.875 |
| 12.0 | 38.878 |
| 12.0 | 38.848 |
| 16.0 | 38.816 |
| 16.0 | 38.886 |
| 16.0 | 38.903 |
| 16.0 | 38.92 |
| 16.0 | 38.896 |
| 20.0 | 38.818 |
| 20.0 | 38.875 |
| 20.0 | 38.902 |
| 20.0 | 38.931 |
| 20.0 | 38.92 |
| 24.0 | 38.768 |
| 24.0 | 38.864 |
| 24.0 | 38.895 |
| 24.0 | 38.934 |
| 24.0 | 38.924 |
| 28.0 | 38.783 |
| 28.0 | 38.88 |
| 28.0 | 38.881 |
| 28.0 | 38.931 |
| 28.0 | 38.922 |
| 32.0 | 38.786 |
| 32.0 | 38.875 |
| 32.0 | 38.889 |
| 32.0 | 38.934 |
| 32.0 | 38.924 |
| 36.0 | 38.762 |
| 36.0 | 38.849 |
| 36.0 | 38.891 |
| 36.0 | 38.924 |
| 36.0 | 38.913 |
| 8.0 | 38.668 |
| 8.0 | 38.742 |
| 8.0 | 38.742 |
| 8.0 | 38.762 |
| 8.0 | 38.74 |
| 12.0 | 38.653 |
| 12.0 | 38.805 |
| 12.0 | 38.818 |
| 12.0 | 38.833 |
| 12.0 | 38.841 |
| 16.0 | 38.642 |
| 16.0 | 38.802 |
| 16.0 | 38.842 |
| 16.0 | 38.876 |
| 16.0 | 38.887 |
| 20.0 | 38.638 |
| 20.0 | 38.786 |
| 20.0 | 38.841 |
| 20.0 | 38.884 |
| 20.0 | 38.904 |
| 24.0 | 38.584 |
| 24.0 | 38.77 |
| 24.0 | 38.83 |
| 24.0 | 38.882 |
| 24.0 | 38.907 |
| 28.0 | 38.594 |
| 28.0 | 38.783 |
| 28.0 | 38.814 |
| 28.0 | 38.876 |
| 28.0 | 38.905 |
| 32.0 | 38.597 |
| 32.0 | 38.777 |
| 32.0 | 38.819 |
| 32.0 | 38.878 |
| 32.0 | 38.905 |
| 36.0 | 38.574 |
| 36.0 | 38.75 |
| 36.0 | 38.82 |
| 36.0 | 38.865 |
| 36.0 | 38.894 |
| 8.0 | 38.645 |
| 8.0 | 38.657 |
| 8.0 | 38.679 |
| 8.0 | 38.712 |
| 8.0 | 38.702 |
| 12.0 | 38.609 |
| 12.0 | 38.709 |
| 12.0 | 38.747 |
| 12.0 | 38.777 |
| 12.0 | 38.8 |
| 16.0 | 38.586 |
| 16.0 | 38.696 |
| 16.0 | 38.766 |
| 16.0 | 38.816 |
| 16.0 | 38.838 |
| 20.0 | 38.577 |
| 20.0 | 38.674 |
| 20.0 | 38.761 |
| 20.0 | 38.821 |
| 20.0 | 38.857 |
| 24.0 | 38.519 |
| 24.0 | 38.655 |
| 24.0 | 38.747 |
| 24.0 | 38.817 |
| 24.0 | 38.858 |
| 28.0 | 38.526 |
| 28.0 | 38.664 |
| 28.0 | 38.727 |
| 28.0 | 38.808 |
| 28.0 | 38.855 |
| 32.0 | 38.528 |
| 32.0 | 38.656 |
| 32.0 | 38.73 |
| 32.0 | 38.806 |
| 32.0 | 38.852 |
| 36.0 | 38.504 |
| 36.0 | 38.627 |
| 36.0 | 38.729 |
| 36.0 | 38.792 |
| 36.0 | 38.838 |
| 8.0 | 38.627 |
| 8.0 | 38.623 |
| 8.0 | 38.628 |
| 8.0 | 38.663 |
| 8.0 | 38.652 |
| 12.0 | 38.58 |
| 12.0 | 38.657 |
| 12.0 | 38.686 |
| 12.0 | 38.725 |
| 12.0 | 38.744 |
| 16.0 | 38.544 |
| 16.0 | 38.634 |
| 16.0 | 38.698 |
| 16.0 | 38.759 |
| 16.0 | 38.779 |
| 20.0 | 38.528 |
| 20.0 | 38.604 |
| 20.0 | 38.686 |
| 20.0 | 38.762 |
| 20.0 | 38.796 |
| 24.0 | 38.468 |
| 24.0 | 38.582 |
| 24.0 | 38.669 |
| 24.0 | 38.755 |
| 24.0 | 38.795 |
| 28.0 | 38.473 |
| 28.0 | 38.588 |
| 28.0 | 38.646 |
| 28.0 | 38.744 |
| 28.0 | 38.79 |
| 32.0 | 38.474 |
| 32.0 | 38.577 |
| 32.0 | 38.647 |
| 32.0 | 38.74 |
| 32.0 | 38.787 |
| 36.0 | 38.45 |
| 36.0 | 38.544 |
| 36.0 | 38.641 |
| 36.0 | 38.721 |
| 36.0 | 38.767 |
| 8.0 | 38.566 |
| 8.0 | 38.604 |
| 8.0 | 38.584 |
| 8.0 | 38.632 |
| 8.0 | 38.623 |
| 12.0 | 38.513 |
| 12.0 | 38.628 |
| 12.0 | 38.631 |
| 12.0 | 38.681 |
| 12.0 | 38.702 |
| 16.0 | 38.47 |
| 16.0 | 38.595 |
| 16.0 | 38.634 |
| 16.0 | 38.709 |
| 16.0 | 38.737 |
| 20.0 | 38.447 |
| 20.0 | 38.56 |
| 20.0 | 38.617 |
| 20.0 | 38.709 |
| 20.0 | 38.752 |
| 24.0 | 38.416 |
| 24.0 | 38.543 |
| 24.0 | 38.597 |
| 24.0 | 38.7 |
| 24.0 | 38.75 |
| 28.0 | 38.417 |
| 28.0 | 38.546 |
| 28.0 | 38.572 |
| 28.0 | 38.687 |
| 28.0 | 38.743 |
| 32.0 | 38.421 |
| 32.0 | 38.534 |
| 32.0 | 38.572 |
| 32.0 | 38.681 |
| 32.0 | 38.738 |
| 36.0 | 38.397 |
| 36.0 | 38.5 |
| 36.0 | 38.565 |
| 36.0 | 38.66 |
| 36.0 | 38.718 |
| 8.0 | 38.585 |
| 8.0 | 38.604 |
| 8.0 | 38.584 |
| 8.0 | 38.599 |
| 8.0 | 38.599 |
| 12.0 | 38.529 |
| 12.0 | 38.626 |
| 12.0 | 38.623 |
| 12.0 | 38.641 |
| 12.0 | 38.674 |
| 16.0 | 38.482 |
| 16.0 | 38.587 |
| 16.0 | 38.619 |
| 16.0 | 38.66 |
| 16.0 | 38.703 |
| 20.0 | 38.456 |
| 20.0 | 38.545 |
| 20.0 | 38.596 |
| 20.0 | 38.655 |
| 20.0 | 38.714 |
| 24.0 | 38.42 |
| 24.0 | 38.524 |
| 24.0 | 38.575 |
| 24.0 | 38.644 |
| 24.0 | 38.709 |
| 28.0 | 38.39 |
| 28.0 | 38.516 |
| 28.0 | 38.552 |
| 28.0 | 38.626 |
| 28.0 | 38.695 |
| 32.0 | 38.391 |
| 32.0 | 38.502 |
| 32.0 | 38.55 |
| 32.0 | 38.618 |
| 32.0 | 38.69 |
| 36.0 | 38.366 |
| 36.0 | 38.467 |
| 36.0 | 38.542 |
| 36.0 | 38.596 |
| 36.0 | 38.669 |
| 8.0 | 38.589 |
| 8.0 | 38.591 |
| 8.0 | 38.578 |
| 8.0 | 38.594 |
| 8.0 | 38.575 |
| 12.0 | 38.533 |
| 12.0 | 38.609 |
| 12.0 | 38.615 |
| 12.0 | 38.63 |
| 12.0 | 38.644 |
| 16.0 | 38.485 |
| 16.0 | 38.569 |
| 16.0 | 38.606 |
| 16.0 | 38.644 |
| 16.0 | 38.667 |
| 20.0 | 38.457 |
| 20.0 | 38.522 |
| 20.0 | 38.578 |
| 20.0 | 38.633 |
| 20.0 | 38.675 |
| 24.0 | 38.422 |
| 24.0 | 38.497 |
| 24.0 | 38.554 |
| 24.0 | 38.618 |
| 24.0 | 38.668 |
| 28.0 | 38.389 |
| 28.0 | 38.486 |
| 28.0 | 38.528 |
| 28.0 | 38.598 |
| 28.0 | 38.652 |
| 32.0 | 38.388 |
| 32.0 | 38.471 |
| 32.0 | 38.525 |
| 32.0 | 38.589 |
| 32.0 | 38.647 |
| 36.0 | 38.363 |
| 36.0 | 38.435 |
| 36.0 | 38.515 |
| 36.0 | 38.566 |
| 36.0 | 38.625 |
| 8.0 | 38.564 |
| 8.0 | 38.561 |
| 8.0 | 38.572 |
| 8.0 | 38.594 |
| 8.0 | 38.547 |
| 12.0 | 38.508 |
| 12.0 | 38.576 |
| 12.0 | 38.606 |
| 12.0 | 38.628 |
| 12.0 | 38.611 |
| 16.0 | 38.462 |
| 16.0 | 38.532 |
| 16.0 | 38.596 |
| 16.0 | 38.637 |
| 16.0 | 38.63 |
| 20.0 | 38.432 |
| 20.0 | 38.481 |
| 20.0 | 38.561 |
| 20.0 | 38.62 |
| 20.0 | 38.63 |
| 24.0 | 38.397 |
| 24.0 | 38.453 |
| 24.0 | 38.534 |
| 24.0 | 38.6 |
| 24.0 | 38.618 |
| 28.0 | 38.362 |
| 28.0 | 38.44 |
| 28.0 | 38.504 |
| 28.0 | 38.578 |
| 28.0 | 38.601 |
| 32.0 | 38.36 |
| 32.0 | 38.423 |
| 32.0 | 38.499 |
| 32.0 | 38.568 |
| 32.0 | 38.594 |
| 36.0 | 38.364 |
| 36.0 | 38.394 |
| 36.0 | 38.488 |
| 36.0 | 38.539 |
| 36.0 | 38.571 |
| 8.0 | 38.701 |
| 8.0 | 38.731 |
| 8.0 | 38.783 |
| 8.0 | 38.739 |
| 8.0 | 38.708 |
| 12.0 | 38.73 |
| 12.0 | 38.808 |
| 12.0 | 38.859 |
| 12.0 | 38.834 |
| 12.0 | 38.819 |
| 16.0 | 38.744 |
| 16.0 | 38.825 |
| 16.0 | 38.873 |
| 16.0 | 38.887 |
| 16.0 | 38.852 |
| 20.0 | 38.74 |
| 20.0 | 38.828 |
| 20.0 | 38.907 |
| 20.0 | 38.882 |
| 20.0 | 38.893 |
| 24.0 | 38.738 |
| 24.0 | 38.83 |
| 24.0 | 38.897 |
| 24.0 | 38.905 |
| 24.0 | 38.896 |
| 28.0 | 38.711 |
| 28.0 | 38.833 |
| 28.0 | 38.898 |
| 28.0 | 38.912 |
| 28.0 | 38.906 |
| 32.0 | 38.705 |
| 32.0 | 38.833 |
| 32.0 | 38.892 |
| 32.0 | 38.898 |
| 32.0 | 38.911 |
| 36.0 | 38.728 |
| 36.0 | 38.823 |
| 36.0 | 38.897 |
| 36.0 | 38.901 |
| 36.0 | 38.904 |
| 8.0 | 38.567 |
| 8.0 | 38.634 |
| 8.0 | 38.699 |
| 8.0 | 38.693 |
| 8.0 | 38.691 |
| 12.0 | 38.576 |
| 12.0 | 38.708 |
| 12.0 | 38.768 |
| 12.0 | 38.786 |
| 12.0 | 38.796 |
| 16.0 | 38.579 |
| 16.0 | 38.718 |
| 16.0 | 38.776 |
| 16.0 | 38.829 |
| 16.0 | 38.825 |
| 20.0 | 38.569 |
| 20.0 | 38.714 |
| 20.0 | 38.805 |
| 20.0 | 38.825 |
| 20.0 | 38.864 |
| 24.0 | 38.564 |
| 24.0 | 38.712 |
| 24.0 | 38.791 |
| 24.0 | 38.843 |
| 24.0 | 38.863 |
| 28.0 | 38.532 |
| 28.0 | 38.712 |
| 28.0 | 38.789 |
| 28.0 | 38.845 |
| 28.0 | 38.871 |
| 32.0 | 38.525 |
| 32.0 | 38.711 |
| 32.0 | 38.779 |
| 32.0 | 38.829 |
| 32.0 | 38.873 |
| 36.0 | 38.549 |
| 36.0 | 38.698 |
| 36.0 | 38.783 |
| 36.0 | 38.83 |
| 36.0 | 38.865 |
| 8.0 | 38.536 |
| 8.0 | 38.54 |
| 8.0 | 38.615 |
| 8.0 | 38.626 |
| 8.0 | 38.626 |
| 12.0 | 38.52 |
| 12.0 | 38.594 |
| 12.0 | 38.679 |
| 12.0 | 38.712 |
| 12.0 | 38.723 |
| 16.0 | 38.51 |
| 16.0 | 38.594 |
| 16.0 | 38.68 |
| 16.0 | 38.752 |
| 16.0 | 38.757 |
| 20.0 | 38.491 |
| 20.0 | 38.582 |
| 20.0 | 38.703 |
| 20.0 | 38.745 |
| 20.0 | 38.793 |
| 24.0 | 38.483 |
| 24.0 | 38.576 |
| 24.0 | 38.685 |
| 24.0 | 38.759 |
| 24.0 | 38.789 |
| 28.0 | 38.449 |
| 28.0 | 38.572 |
| 28.0 | 38.678 |
| 28.0 | 38.759 |
| 28.0 | 38.794 |
| 32.0 | 38.441 |
| 32.0 | 38.568 |
| 32.0 | 38.666 |
| 32.0 | 38.739 |
| 32.0 | 38.795 |
| 36.0 | 38.464 |
| 36.0 | 38.553 |
| 36.0 | 38.668 |
| 36.0 | 38.739 |
| 36.0 | 38.785 |
| 8.0 | 38.496 |
| 8.0 | 38.537 |
| 8.0 | 38.564 |
| 8.0 | 38.562 |
| 8.0 | 38.574 |
| 12.0 | 38.467 |
| 12.0 | 38.57 |
| 12.0 | 38.61 |
| 12.0 | 38.636 |
| 12.0 | 38.667 |
| 16.0 | 38.44 |
| 16.0 | 38.559 |
| 16.0 | 38.604 |
| 16.0 | 38.676 |
| 16.0 | 38.698 |
| 20.0 | 38.415 |
| 20.0 | 38.539 |
| 20.0 | 38.619 |
| 20.0 | 38.664 |
| 20.0 | 38.732 |
| 24.0 | 38.403 |
| 24.0 | 38.53 |
| 24.0 | 38.598 |
| 24.0 | 38.676 |
| 24.0 | 38.725 |
| 28.0 | 38.369 |
| 28.0 | 38.523 |
| 28.0 | 38.587 |
| 28.0 | 38.673 |
| 28.0 | 38.729 |
| 32.0 | 38.359 |
| 32.0 | 38.517 |
| 32.0 | 38.574 |
| 32.0 | 38.65 |
| 32.0 | 38.728 |
| 36.0 | 38.38 |
| 36.0 | 38.498 |
| 36.0 | 38.573 |
| 36.0 | 38.648 |
| 36.0 | 38.716 |
| 8.0 | 38.5 |
| 8.0 | 38.513 |
| 8.0 | 38.545 |
| 8.0 | 38.526 |
| 8.0 | 38.534 |
| 12.0 | 38.467 |
| 12.0 | 38.536 |
| 12.0 | 38.578 |
| 12.0 | 38.587 |
| 12.0 | 38.615 |
| 16.0 | 38.433 |
| 16.0 | 38.514 |
| 16.0 | 38.56 |
| 16.0 | 38.619 |
| 16.0 | 38.641 |
| 20.0 | 38.401 |
| 20.0 | 38.488 |
| 20.0 | 38.571 |
| 20.0 | 38.603 |
| 20.0 | 38.671 |
| 24.0 | 38.374 |
| 24.0 | 38.474 |
| 24.0 | 38.547 |
| 24.0 | 38.613 |
| 24.0 | 38.662 |
| 28.0 | 38.336 |
| 28.0 | 38.464 |
| 28.0 | 38.535 |
| 28.0 | 38.608 |
| 28.0 | 38.663 |
| 32.0 | 38.325 |
| 32.0 | 38.456 |
| 32.0 | 38.52 |
| 32.0 | 38.583 |
| 32.0 | 38.661 |
| 36.0 | 38.345 |
| 36.0 | 38.435 |
| 36.0 | 38.515 |
| 36.0 | 38.576 |
| 36.0 | 38.648 |
| 8.0 | 38.493 |
| 8.0 | 38.491 |
| 8.0 | 38.539 |
| 8.0 | 38.506 |
| 8.0 | 38.502 |
| 12.0 | 38.457 |
| 12.0 | 38.509 |
| 12.0 | 38.565 |
| 12.0 | 38.556 |
| 12.0 | 38.575 |
| 16.0 | 38.419 |
| 16.0 | 38.481 |
| 16.0 | 38.54 |
| 16.0 | 38.578 |
| 16.0 | 38.591 |
| 20.0 | 38.385 |
| 20.0 | 38.446 |
| 20.0 | 38.544 |
| 20.0 | 38.556 |
| 20.0 | 38.618 |
| 24.0 | 38.354 |
| 24.0 | 38.428 |
| 24.0 | 38.515 |
| 24.0 | 38.564 |
| 24.0 | 38.606 |
| 28.0 | 38.325 |
| 28.0 | 38.414 |
| 28.0 | 38.501 |
| 28.0 | 38.554 |
| 28.0 | 38.601 |
| 32.0 | 38.314 |
| 32.0 | 38.404 |
| 32.0 | 38.483 |
| 32.0 | 38.527 |
| 32.0 | 38.597 |
| 36.0 | 38.335 |
| 36.0 | 38.382 |
| 36.0 | 38.477 |
| 36.0 | 38.518 |
| 36.0 | 38.579 |
| 8.0 | 38.489 |
| 8.0 | 38.473 |
| 8.0 | 38.516 |
| 8.0 | 38.501 |
| 8.0 | 38.474 |
| 12.0 | 38.452 |
| 12.0 | 38.488 |
| 12.0 | 38.539 |
| 12.0 | 38.546 |
| 12.0 | 38.537 |
| 16.0 | 38.416 |
| 16.0 | 38.455 |
| 16.0 | 38.509 |
| 16.0 | 38.562 |
| 16.0 | 38.549 |
| 20.0 | 38.381 |
| 20.0 | 38.416 |
| 20.0 | 38.508 |
| 20.0 | 38.534 |
| 20.0 | 38.569 |
| 24.0 | 38.348 |
| 24.0 | 38.393 |
| 24.0 | 38.476 |
| 24.0 | 38.538 |
| 24.0 | 38.554 |
| 28.0 | 38.318 |
| 28.0 | 38.376 |
| 28.0 | 38.457 |
| 28.0 | 38.525 |
| 28.0 | 38.547 |
| 32.0 | 38.302 |
| 32.0 | 38.365 |
| 32.0 | 38.441 |
| 32.0 | 38.495 |
| 32.0 | 38.544 |
| 36.0 | 38.323 |
| 36.0 | 38.342 |
| 36.0 | 38.433 |
| 36.0 | 38.485 |
| 36.0 | 38.524 |
| 8.0 | 38.509 |
| 8.0 | 38.476 |
| 8.0 | 38.506 |
| 8.0 | 38.493 |
| 8.0 | 38.471 |
| 12.0 | 38.473 |
| 12.0 | 38.49 |
| 12.0 | 38.524 |
| 12.0 | 38.537 |
| 12.0 | 38.532 |
| 16.0 | 38.434 |
| 16.0 | 38.456 |
| 16.0 | 38.492 |
| 16.0 | 38.55 |
| 16.0 | 38.537 |
| 20.0 | 38.397 |
| 20.0 | 38.413 |
| 20.0 | 38.487 |
| 20.0 | 38.518 |
| 20.0 | 38.553 |
| 24.0 | 38.362 |
| 24.0 | 38.387 |
| 24.0 | 38.446 |
| 24.0 | 38.514 |
| 24.0 | 38.533 |
| 28.0 | 38.332 |
| 28.0 | 38.367 |
| 28.0 | 38.424 |
| 28.0 | 38.498 |
| 28.0 | 38.522 |
| 32.0 | 38.315 |
| 32.0 | 38.355 |
| 32.0 | 38.404 |
| 32.0 | 38.468 |
| 32.0 | 38.517 |
| 36.0 | 38.32 |
| 36.0 | 38.33 |
| 36.0 | 38.397 |
| 36.0 | 38.456 |
| 36.0 | 38.495 |